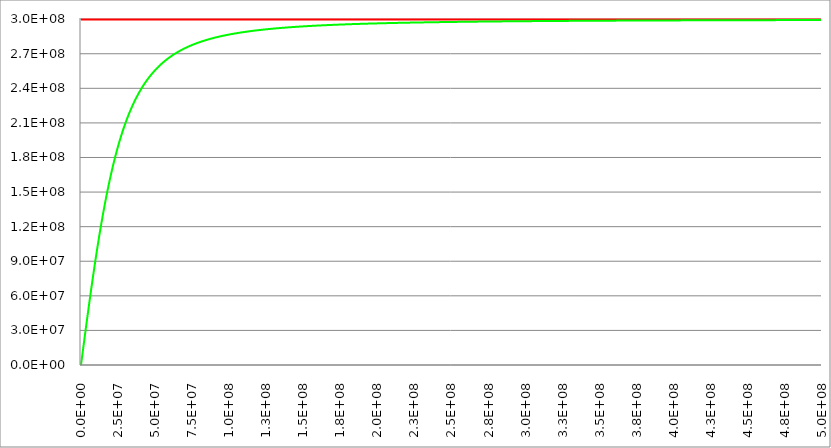
| Category | Series 1 | Series 0 | Series 2 |
|---|---|---|---|
| 0.0 | 299792458 | 0 |  |
| 250000.0 | 299792458 | 2449918.19 |  |
| 500000.0 | 299792458 | 4899345.62 |  |
| 750000.0 | 299792458 | 7347792.021 |  |
| 1000000.0 | 299792458 | 9794768.106 |  |
| 1250000.0 | 299792458 | 12239786.057 |  |
| 1500000.0 | 299792458 | 14682360.01 |  |
| 1750000.0 | 299792458 | 17122006.537 |  |
| 2000000.0 | 299792458 | 19558245.116 |  |
| 2250000.0 | 299792458 | 21990598.601 |  |
| 2500000.0 | 299792458 | 24418593.685 |  |
| 2750000.0 | 299792458 | 26841761.344 |  |
| 3000000.0 | 299792458 | 29259637.286 |  |
| 3250000.0 | 299792458 | 31671762.374 |  |
| 3500000.0 | 299792458 | 34077683.052 |  |
| 3750000.0 | 299792458 | 36476951.747 |  |
| 4000000.0 | 299792458 | 38869127.264 |  |
| 4250000.0 | 299792458 | 41253775.165 |  |
| 4500000.0 | 299792458 | 43630468.134 |  |
| 4750000.0 | 299792458 | 45998786.326 |  |
| 5000000.0 | 299792458 | 48358317.698 |  |
| 5250000.0 | 299792458 | 50708658.331 |  |
| 5500000.0 | 299792458 | 53049412.725 |  |
| 5750000.0 | 299792458 | 55380194.085 |  |
| 6000000.0 | 299792458 | 57700624.584 |  |
| 6250000.0 | 299792458 | 60010335.612 |  |
| 6500000.0 | 299792458 | 62308968.001 |  |
| 6750000.0 | 299792458 | 64596172.241 |  |
| 7000000.0 | 299792458 | 66871608.67 |  |
| 7250000.0 | 299792458 | 69134947.645 |  |
| 7500000.0 | 299792458 | 71385869.702 |  |
| 7750000.0 | 299792458 | 73624065.691 |  |
| 8000000.0 | 299792458 | 75849236.893 |  |
| 8250000.0 | 299792458 | 78061095.124 |  |
| 8500000.0 | 299792458 | 80259362.817 |  |
| 8750000.0 | 299792458 | 82443773.085 |  |
| 9000000.0 | 299792458 | 84614069.773 |  |
| 9250000.0 | 299792458 | 86770007.487 |  |
| 9500000.0 | 299792458 | 88911351.607 |  |
| 9750000.0 | 299792458 | 91037878.29 |  |
| 10000000.0 | 299792458 | 93149374.452 |  |
| 10250000.0 | 299792458 | 95245637.732 |  |
| 10500000.0 | 299792458 | 97326476.452 |  |
| 10750000.0 | 299792458 | 99391709.551 |  |
| 11000000.0 | 299792458 | 101441166.513 |  |
| 11250000.0 | 299792458 | 103474687.28 |  |
| 11500000.0 | 299792458 | 105492122.154 |  |
| 11750000.0 | 299792458 | 107493331.684 |  |
| 12000000.0 | 299792458 | 109478186.546 |  |
| 12250000.0 | 299792458 | 111446567.407 |  |
| 12500000.0 | 299792458 | 113398364.789 |  |
| 12750000.0 | 299792458 | 115333478.91 |  |
| 13000000.0 | 299792458 | 117251819.531 |  |
| 13250000.0 | 299792458 | 119153305.782 |  |
| 13500000.0 | 299792458 | 121037865.991 |  |
| 13750000.0 | 299792458 | 122905437.501 |  |
| 14000000.0 | 299792458 | 124755966.481 |  |
| 14250000.0 | 299792458 | 126589407.732 |  |
| 14500000.0 | 299792458 | 128405724.492 |  |
| 14750000.0 | 299792458 | 130204888.227 |  |
| 15000000.0 | 299792458 | 131986878.43 |  |
| 15250000.0 | 299792458 | 133751682.41 |  |
| 15500000.0 | 299792458 | 135499295.077 |  |
| 15750000.0 | 299792458 | 137229718.728 |  |
| 16000000.0 | 299792458 | 138942962.833 |  |
| 16250000.0 | 299792458 | 140639043.813 |  |
| 16500000.0 | 299792458 | 142317984.824 |  |
| 16750000.0 | 299792458 | 143979815.538 |  |
| 17000000.0 | 299792458 | 145624571.923 |  |
| 17250000.0 | 299792458 | 147252296.024 |  |
| 17500000.0 | 299792458 | 148863035.746 |  |
| 17750000.0 | 299792458 | 150456844.637 |  |
| 18000000.0 | 299792458 | 152033781.672 |  |
| 18250000.0 | 299792458 | 153593911.042 |  |
| 18500000.0 | 299792458 | 155137301.936 |  |
| 18750000.0 | 299792458 | 156664028.342 |  |
| 19000000.0 | 299792458 | 158174168.829 |  |
| 19250000.0 | 299792458 | 159667806.353 |  |
| 19500000.0 | 299792458 | 161145028.049 |  |
| 19750000.0 | 299792458 | 162605925.036 |  |
| 20000000.0 | 299792458 | 164050592.226 |  |
| 20250000.0 | 299792458 | 165479128.126 |  |
| 20500000.0 | 299792458 | 166891634.656 |  |
| 20750000.0 | 299792458 | 168288216.966 |  |
| 21000000.0 | 299792458 | 169668983.253 |  |
| 21250000.0 | 299792458 | 171034044.589 |  |
| 21500000.0 | 299792458 | 172383514.746 |  |
| 21750000.0 | 299792458 | 173717510.035 |  |
| 22000000.0 | 299792458 | 175036149.135 |  |
| 22250000.0 | 299792458 | 176339552.941 |  |
| 22500000.0 | 299792458 | 177627844.405 |  |
| 22750000.0 | 299792458 | 178901148.39 |  |
| 23000000.0 | 299792458 | 180159591.519 |  |
| 23250000.0 | 299792458 | 181403302.038 |  |
| 23500000.0 | 299792458 | 182632409.68 |  |
| 23750000.0 | 299792458 | 183847045.524 |  |
| 24000000.0 | 299792458 | 185047341.876 |  |
| 24250000.0 | 299792458 | 186233432.14 |  |
| 24500000.0 | 299792458 | 187405450.698 |  |
| 24750000.0 | 299792458 | 188563532.794 |  |
| 25000000.0 | 299792458 | 189707814.425 |  |
| 25250000.0 | 299792458 | 190838432.228 |  |
| 25500000.0 | 299792458 | 191955523.383 |  |
| 25750000.0 | 299792458 | 193059225.507 |  |
| 26000000.0 | 299792458 | 194149676.563 |  |
| 26250000.0 | 299792458 | 195227014.765 |  |
| 26500000.0 | 299792458 | 196291378.49 |  |
| 26750000.0 | 299792458 | 197342906.197 |  |
| 27000000.0 | 299792458 | 198381736.34 |  |
| 27250000.0 | 299792458 | 199408007.296 |  |
| 27500000.0 | 299792458 | 200421857.288 |  |
| 27750000.0 | 299792458 | 201423424.315 |  |
| 28000000.0 | 299792458 | 202412846.085 |  |
| 28250000.0 | 299792458 | 203390259.951 |  |
| 28500000.0 | 299792458 | 204355802.85 |  |
| 28750000.0 | 299792458 | 205309611.243 |  |
| 29000000.0 | 299792458 | 206251821.065 |  |
| 29250000.0 | 299792458 | 207182567.665 |  |
| 29500000.0 | 299792458 | 208101985.763 |  |
| 29750000.0 | 299792458 | 209010209.403 |  |
| 30000000.0 | 299792458 | 209907371.905 |  |
| 30250000.0 | 299792458 | 210793605.824 |  |
| 30500000.0 | 299792458 | 211669042.915 |  |
| 30750000.0 | 299792458 | 212533814.093 |  |
| 31000000.0 | 299792458 | 213388049.398 |  |
| 31250000.0 | 299792458 | 214231877.964 |  |
| 31500000.0 | 299792458 | 215065427.988 |  |
| 31750000.0 | 299792458 | 215888826.703 |  |
| 32000000.0 | 299792458 | 216702200.352 |  |
| 32250000.0 | 299792458 | 217505674.159 |  |
| 32500000.0 | 299792458 | 218299372.315 |  |
| 32750000.0 | 299792458 | 219083417.95 |  |
| 33000000.0 | 299792458 | 219857933.118 |  |
| 33250000.0 | 299792458 | 220623038.777 |  |
| 33500000.0 | 299792458 | 221378854.777 |  |
| 33750000.0 | 299792458 | 222125499.841 |  |
| 34000000.0 | 299792458 | 222863091.555 |  |
| 34250000.0 | 299792458 | 223591746.357 |  |
| 34500000.0 | 299792458 | 224311579.525 |  |
| 34750000.0 | 299792458 | 225022705.169 |  |
| 35000000.0 | 299792458 | 225725236.222 |  |
| 35250000.0 | 299792458 | 226419284.437 |  |
| 35500000.0 | 299792458 | 227104960.378 |  |
| 35750000.0 | 299792458 | 227782373.416 |  |
| 36000000.0 | 299792458 | 228451631.728 |  |
| 36250000.0 | 299792458 | 229112842.29 |  |
| 36500000.0 | 299792458 | 229766110.881 |  |
| 36750000.0 | 299792458 | 230411542.078 |  |
| 37000000.0 | 299792458 | 231049239.259 |  |
| 37250000.0 | 299792458 | 231679304.6 |  |
| 37500000.0 | 299792458 | 232301839.082 |  |
| 37750000.0 | 299792458 | 232916942.487 |  |
| 38000000.0 | 299792458 | 233524713.408 |  |
| 38250000.0 | 299792458 | 234125249.247 |  |
| 38500000.0 | 299792458 | 234718646.22 |  |
| 38750000.0 | 299792458 | 235304999.364 |  |
| 39000000.0 | 299792458 | 235884402.54 |  |
| 39250000.0 | 299792458 | 236456948.443 |  |
| 39500000.0 | 299792458 | 237022728.599 |  |
| 39750000.0 | 299792458 | 237581833.383 |  |
| 40000000.0 | 299792458 | 238134352.017 |  |
| 40250000.0 | 299792458 | 238680372.582 |  |
| 40500000.0 | 299792458 | 239219982.024 |  |
| 40750000.0 | 299792458 | 239753266.165 |  |
| 41000000.0 | 299792458 | 240280309.705 |  |
| 41250000.0 | 299792458 | 240801196.238 |  |
| 41500000.0 | 299792458 | 241316008.255 |  |
| 41750000.0 | 299792458 | 241824827.159 |  |
| 42000000.0 | 299792458 | 242327733.269 |  |
| 42250000.0 | 299792458 | 242824805.831 |  |
| 42500000.0 | 299792458 | 243316123.029 |  |
| 42750000.0 | 299792458 | 243801761.997 |  |
| 43000000.0 | 299792458 | 244281798.822 |  |
| 43250000.0 | 299792458 | 244756308.563 |  |
| 43500000.0 | 299792458 | 245225365.254 |  |
| 43750000.0 | 299792458 | 245689041.919 |  |
| 44000000.0 | 299792458 | 246147410.581 |  |
| 44250000.0 | 299792458 | 246600542.272 |  |
| 44500000.0 | 299792458 | 247048507.046 |  |
| 44750000.0 | 299792458 | 247491373.986 |  |
| 45000000.0 | 299792458 | 247929211.219 |  |
| 45250000.0 | 299792458 | 248362085.924 |  |
| 45500000.0 | 299792458 | 248790064.343 |  |
| 45750000.0 | 299792458 | 249213211.795 |  |
| 46000000.0 | 299792458 | 249631592.682 |  |
| 46250000.0 | 299792458 | 250045270.504 |  |
| 46500000.0 | 299792458 | 250454307.868 |  |
| 46750000.0 | 299792458 | 250858766.499 |  |
| 47000000.0 | 299792458 | 251258707.251 |  |
| 47250000.0 | 299792458 | 251654190.119 |  |
| 47500000.0 | 299792458 | 252045274.248 |  |
| 47750000.0 | 299792458 | 252432017.945 |  |
| 48000000.0 | 299792458 | 252814478.689 |  |
| 48250000.0 | 299792458 | 253192713.142 |  |
| 48500000.0 | 299792458 | 253566777.16 |  |
| 48750000.0 | 299792458 | 253936725.803 |  |
| 49000000.0 | 299792458 | 254302613.346 |  |
| 49250000.0 | 299792458 | 254664493.288 |  |
| 49500000.0 | 299792458 | 255022418.365 |  |
| 49750000.0 | 299792458 | 255376440.558 |  |
| 50000000.0 | 299792458 | 255726611.105 |  |
| 50250000.0 | 299792458 | 256072980.509 |  |
| 50500000.0 | 299792458 | 256415598.55 |  |
| 50750000.0 | 299792458 | 256754514.293 |  |
| 51000000.0 | 299792458 | 257089776.102 |  |
| 51250000.0 | 299792458 | 257421431.643 |  |
| 51500000.0 | 299792458 | 257749527.9 |  |
| 51750000.0 | 299792458 | 258074111.182 |  |
| 52000000.0 | 299792458 | 258395227.133 |  |
| 52250000.0 | 299792458 | 258712920.741 |  |
| 52500000.0 | 299792458 | 259027236.346 |  |
| 52750000.0 | 299792458 | 259338217.652 |  |
| 53000000.0 | 299792458 | 259645907.736 |  |
| 53250000.0 | 299792458 | 259950349.054 |  |
| 53500000.0 | 299792458 | 260251583.452 |  |
| 53750000.0 | 299792458 | 260549652.175 |  |
| 54000000.0 | 299792458 | 260844595.876 |  |
| 54250000.0 | 299792458 | 261136454.624 |  |
| 54500000.0 | 299792458 | 261425267.911 |  |
| 54750000.0 | 299792458 | 261711074.663 |  |
| 55000000.0 | 299792458 | 261993913.248 |  |
| 55250000.0 | 299792458 | 262273821.481 |  |
| 55500000.0 | 299792458 | 262550836.637 |  |
| 55750000.0 | 299792458 | 262824995.456 |  |
| 56000000.0 | 299792458 | 263096334.151 |  |
| 56250000.0 | 299792458 | 263364888.416 |  |
| 56500000.0 | 299792458 | 263630693.436 |  |
| 56750000.0 | 299792458 | 263893783.889 |  |
| 57000000.0 | 299792458 | 264154193.961 |  |
| 57250000.0 | 299792458 | 264411957.347 |  |
| 57500000.0 | 299792458 | 264667107.261 |  |
| 57750000.0 | 299792458 | 264919676.444 |  |
| 58000000.0 | 299792458 | 265169697.17 |  |
| 58250000.0 | 299792458 | 265417201.252 |  |
| 58500000.0 | 299792458 | 265662220.052 |  |
| 58750000.0 | 299792458 | 265904784.483 |  |
| 59000000.0 | 299792458 | 266144925.021 |  |
| 59250000.0 | 299792458 | 266382671.708 |  |
| 59500000.0 | 299792458 | 266618054.161 |  |
| 59750000.0 | 299792458 | 266851101.576 |  |
| 60000000.0 | 299792458 | 267081842.734 |  |
| 60250000.0 | 299792458 | 267310306.012 |  |
| 60500000.0 | 299792458 | 267536519.385 |  |
| 60750000.0 | 299792458 | 267760510.43 |  |
| 61000000.0 | 299792458 | 267982306.339 |  |
| 61250000.0 | 299792458 | 268201933.919 |  |
| 61500000.0 | 299792458 | 268419419.598 |  |
| 61750000.0 | 299792458 | 268634789.436 |  |
| 62000000.0 | 299792458 | 268848069.125 |  |
| 62250000.0 | 299792458 | 269059283.995 |  |
| 62500000.0 | 299792458 | 269268459.024 |  |
| 62750000.0 | 299792458 | 269475618.838 |  |
| 63000000.0 | 299792458 | 269680787.721 |  |
| 63250000.0 | 299792458 | 269883989.616 |  |
| 63500000.0 | 299792458 | 270085248.133 |  |
| 63750000.0 | 299792458 | 270284586.552 |  |
| 64000000.0 | 299792458 | 270482027.831 |  |
| 64250000.0 | 299792458 | 270677594.608 |  |
| 64500000.0 | 299792458 | 270871309.207 |  |
| 64750000.0 | 299792458 | 271063193.642 |  |
| 65000000.0 | 299792458 | 271253269.623 |  |
| 65250000.0 | 299792458 | 271441558.561 |  |
| 65500000.0 | 299792458 | 271628081.569 |  |
| 65750000.0 | 299792458 | 271812859.472 |  |
| 66000000.0 | 299792458 | 271995912.805 |  |
| 66250000.0 | 299792458 | 272177261.824 |  |
| 66500000.0 | 299792458 | 272356926.505 |  |
| 66750000.0 | 299792458 | 272534926.55 |  |
| 67000000.0 | 299792458 | 272711281.393 |  |
| 67250000.0 | 299792458 | 272886010.201 |  |
| 67500000.0 | 299792458 | 273059131.88 |  |
| 67750000.0 | 299792458 | 273230665.079 |  |
| 68000000.0 | 299792458 | 273400628.191 |  |
| 68250000.0 | 299792458 | 273569039.362 |  |
| 68500000.0 | 299792458 | 273735916.49 |  |
| 68750000.0 | 299792458 | 273901277.231 |  |
| 69000000.0 | 299792458 | 274065139.002 |  |
| 69250000.0 | 299792458 | 274227518.985 |  |
| 69500000.0 | 299792458 | 274388434.131 |  |
| 69750000.0 | 299792458 | 274547901.162 |  |
| 70000000.0 | 299792458 | 274705936.575 |  |
| 70250000.0 | 299792458 | 274862556.646 |  |
| 70500000.0 | 299792458 | 275017777.433 |  |
| 70750000.0 | 299792458 | 275171614.78 |  |
| 71000000.0 | 299792458 | 275324084.316 |  |
| 71250000.0 | 299792458 | 275475201.466 |  |
| 71500000.0 | 299792458 | 275624981.448 |  |
| 71750000.0 | 299792458 | 275773439.275 |  |
| 72000000.0 | 299792458 | 275920589.766 |  |
| 72250000.0 | 299792458 | 276066447.538 |  |
| 72500000.0 | 299792458 | 276211027.02 |  |
| 72750000.0 | 299792458 | 276354342.445 |  |
| 73000000.0 | 299792458 | 276496407.864 |  |
| 73250000.0 | 299792458 | 276637237.138 |  |
| 73500000.0 | 299792458 | 276776843.95 |  |
| 73750000.0 | 299792458 | 276915241.8 |  |
| 74000000.0 | 299792458 | 277052444.014 |  |
| 74250000.0 | 299792458 | 277188463.741 |  |
| 74500000.0 | 299792458 | 277323313.962 |  |
| 74750000.0 | 299792458 | 277457007.485 |  |
| 75000000.0 | 299792458 | 277589556.954 |  |
| 75250000.0 | 299792458 | 277720974.848 |  |
| 75500000.0 | 299792458 | 277851273.483 |  |
| 75750000.0 | 299792458 | 277980465.018 |  |
| 76000000.0 | 299792458 | 278108561.454 |  |
| 76250000.0 | 299792458 | 278235574.635 |  |
| 76500000.0 | 299792458 | 278361516.256 |  |
| 76750000.0 | 299792458 | 278486397.86 |  |
| 77000000.0 | 299792458 | 278610230.841 |  |
| 77250000.0 | 299792458 | 278733026.449 |  |
| 77500000.0 | 299792458 | 278854795.788 |  |
| 77750000.0 | 299792458 | 278975549.823 |  |
| 78000000.0 | 299792458 | 279095299.376 |  |
| 78250000.0 | 299792458 | 279214055.135 |  |
| 78500000.0 | 299792458 | 279331827.648 |  |
| 78750000.0 | 299792458 | 279448627.334 |  |
| 79000000.0 | 299792458 | 279564464.476 |  |
| 79250000.0 | 299792458 | 279679349.23 |  |
| 79500000.0 | 299792458 | 279793291.622 |  |
| 79750000.0 | 299792458 | 279906301.554 |  |
| 80000000.0 | 299792458 | 280018388.802 |  |
| 80250000.0 | 299792458 | 280129563.019 |  |
| 80500000.0 | 299792458 | 280239833.738 |  |
| 80750000.0 | 299792458 | 280349210.374 |  |
| 81000000.0 | 299792458 | 280457702.221 |  |
| 81250000.0 | 299792458 | 280565318.462 |  |
| 81500000.0 | 299792458 | 280672068.163 |  |
| 81750000.0 | 299792458 | 280777960.276 |  |
| 82000000.0 | 299792458 | 280883003.647 |  |
| 82250000.0 | 299792458 | 280987207.008 |  |
| 82500000.0 | 299792458 | 281090578.985 |  |
| 82750000.0 | 299792458 | 281193128.099 |  |
| 83000000.0 | 299792458 | 281294862.763 |  |
| 83250000.0 | 299792458 | 281395791.291 |  |
| 83500000.0 | 299792458 | 281495921.891 |  |
| 83750000.0 | 299792458 | 281595262.673 |  |
| 84000000.0 | 299792458 | 281693821.649 |  |
| 84250000.0 | 299792458 | 281791606.73 |  |
| 84500000.0 | 299792458 | 281888625.733 |  |
| 84750000.0 | 299792458 | 281984886.38 |  |
| 85000000.0 | 299792458 | 282080396.3 |  |
| 85250000.0 | 299792458 | 282175163.027 |  |
| 85500000.0 | 299792458 | 282269194.008 |  |
| 85750000.0 | 299792458 | 282362496.596 |  |
| 86000000.0 | 299792458 | 282455078.06 |  |
| 86250000.0 | 299792458 | 282546945.578 |  |
| 86500000.0 | 299792458 | 282638106.243 |  |
| 86750000.0 | 299792458 | 282728567.065 |  |
| 87000000.0 | 299792458 | 282818334.967 |  |
| 87250000.0 | 299792458 | 282907416.792 |  |
| 87500000.0 | 299792458 | 282995819.302 |  |
| 87750000.0 | 299792458 | 283083549.175 |  |
| 88000000.0 | 299792458 | 283170613.015 |  |
| 88250000.0 | 299792458 | 283257017.343 |  |
| 88500000.0 | 299792458 | 283342768.606 |  |
| 88750000.0 | 299792458 | 283427873.174 |  |
| 89000000.0 | 299792458 | 283512337.343 |  |
| 89250000.0 | 299792458 | 283596167.332 |  |
| 89500000.0 | 299792458 | 283679369.291 |  |
| 89750000.0 | 299792458 | 283761949.296 |  |
| 90000000.0 | 299792458 | 283843913.352 |  |
| 90250000.0 | 299792458 | 283925267.394 |  |
| 90500000.0 | 299792458 | 284006017.288 |  |
| 90750000.0 | 299792458 | 284086168.832 |  |
| 91000000.0 | 299792458 | 284165727.757 |  |
| 91250000.0 | 299792458 | 284244699.727 |  |
| 91500000.0 | 299792458 | 284323090.342 |  |
| 91750000.0 | 299792458 | 284400905.134 |  |
| 92000000.0 | 299792458 | 284478149.576 |  |
| 92250000.0 | 299792458 | 284554829.074 |  |
| 92500000.0 | 299792458 | 284630948.974 |  |
| 92750000.0 | 299792458 | 284706514.561 |  |
| 93000000.0 | 299792458 | 284781531.059 |  |
| 93250000.0 | 299792458 | 284856003.632 |  |
| 93500000.0 | 299792458 | 284929937.385 |  |
| 93750000.0 | 299792458 | 285003337.367 |  |
| 94000000.0 | 299792458 | 285076208.567 |  |
| 94250000.0 | 299792458 | 285148555.92 |  |
| 94500000.0 | 299792458 | 285220384.303 |  |
| 94750000.0 | 299792458 | 285291698.539 |  |
| 95000000.0 | 299792458 | 285362503.397 |  |
| 95250000.0 | 299792458 | 285432803.592 |  |
| 95500000.0 | 299792458 | 285502603.786 |  |
| 95750000.0 | 299792458 | 285571908.588 |  |
| 96000000.0 | 299792458 | 285640722.558 |  |
| 96250000.0 | 299792458 | 285709050.202 |  |
| 96500000.0 | 299792458 | 285776895.977 |  |
| 96750000.0 | 299792458 | 285844264.292 |  |
| 97000000.0 | 299792458 | 285911159.504 |  |
| 97250000.0 | 299792458 | 285977585.925 |  |
| 97500000.0 | 299792458 | 286043547.817 |  |
| 97750000.0 | 299792458 | 286109049.395 |  |
| 98000000.0 | 299792458 | 286174094.828 |  |
| 98250000.0 | 299792458 | 286238688.241 |  |
| 98500000.0 | 299792458 | 286302833.711 |  |
| 98750000.0 | 299792458 | 286366535.271 |  |
| 99000000.0 | 299792458 | 286429796.911 |  |
| 99250000.0 | 299792458 | 286492622.575 |  |
| 99500000.0 | 299792458 | 286555016.168 |  |
| 99750000.0 | 299792458 | 286616981.548 |  |
| 100000000.0 | 299792458 | 286678522.534 |  |
| 100250000.0 | 299792458 | 286739642.903 |  |
| 100500000.0 | 299792458 | 286800346.391 |  |
| 100750000.0 | 299792458 | 286860636.693 |  |
| 101000000.0 | 299792458 | 286920517.465 |  |
| 101250000.0 | 299792458 | 286979992.323 |  |
| 101500000.0 | 299792458 | 287039064.845 |  |
| 101750000.0 | 299792458 | 287097738.57 |  |
| 102000000.0 | 299792458 | 287156016.999 |  |
| 102250000.0 | 299792458 | 287213903.596 |  |
| 102500000.0 | 299792458 | 287271401.788 |  |
| 102750000.0 | 299792458 | 287328514.964 |  |
| 103000000.0 | 299792458 | 287385246.48 |  |
| 103250000.0 | 299792458 | 287441599.654 |  |
| 103500000.0 | 299792458 | 287497577.77 |  |
| 103750000.0 | 299792458 | 287553184.076 |  |
| 104000000.0 | 299792458 | 287608421.787 |  |
| 104250000.0 | 299792458 | 287663294.083 |  |
| 104500000.0 | 299792458 | 287717804.112 |  |
| 104750000.0 | 299792458 | 287771954.988 |  |
| 105000000.0 | 299792458 | 287825749.793 |  |
| 105250000.0 | 299792458 | 287879191.576 |  |
| 105500000.0 | 299792458 | 287932283.354 |  |
| 105750000.0 | 299792458 | 287985028.113 |  |
| 106000000.0 | 299792458 | 288037428.808 |  |
| 106250000.0 | 299792458 | 288089488.364 |  |
| 106500000.0 | 299792458 | 288141209.674 |  |
| 106750000.0 | 299792458 | 288192595.602 |  |
| 107000000.0 | 299792458 | 288243648.983 |  |
| 107250000.0 | 299792458 | 288294372.622 |  |
| 107500000.0 | 299792458 | 288344769.295 |  |
| 107750000.0 | 299792458 | 288394841.75 |  |
| 108000000.0 | 299792458 | 288444592.706 |  |
| 108250000.0 | 299792458 | 288494024.855 |  |
| 108500000.0 | 299792458 | 288543140.861 |  |
| 108750000.0 | 299792458 | 288591943.362 |  |
| 109000000.0 | 299792458 | 288640434.966 |  |
| 109250000.0 | 299792458 | 288688618.259 |  |
| 109500000.0 | 299792458 | 288736495.797 |  |
| 109750000.0 | 299792458 | 288784070.111 |  |
| 110000000.0 | 299792458 | 288831343.708 |  |
| 110250000.0 | 299792458 | 288878319.067 |  |
| 110500000.0 | 299792458 | 288924998.646 |  |
| 110750000.0 | 299792458 | 288971384.873 |  |
| 111000000.0 | 299792458 | 289017480.156 |  |
| 111250000.0 | 299792458 | 289063286.877 |  |
| 111500000.0 | 299792458 | 289108807.394 |  |
| 111750000.0 | 299792458 | 289154044.042 |  |
| 112000000.0 | 299792458 | 289198999.133 |  |
| 112250000.0 | 299792458 | 289243674.955 |  |
| 112500000.0 | 299792458 | 289288073.774 |  |
| 112750000.0 | 299792458 | 289332197.833 |  |
| 113000000.0 | 299792458 | 289376049.353 |  |
| 113250000.0 | 299792458 | 289419630.534 |  |
| 113500000.0 | 299792458 | 289462943.552 |  |
| 113750000.0 | 299792458 | 289505990.565 |  |
| 114000000.0 | 299792458 | 289548773.705 |  |
| 114250000.0 | 299792458 | 289591295.087 |  |
| 114500000.0 | 299792458 | 289633556.805 |  |
| 114750000.0 | 299792458 | 289675560.93 |  |
| 115000000.0 | 299792458 | 289717309.515 |  |
| 115250000.0 | 299792458 | 289758804.593 |  |
| 115500000.0 | 299792458 | 289800048.174 |  |
| 115750000.0 | 299792458 | 289841042.254 |  |
| 116000000.0 | 299792458 | 289881788.804 |  |
| 116250000.0 | 299792458 | 289922289.78 |  |
| 116500000.0 | 299792458 | 289962547.118 |  |
| 116750000.0 | 299792458 | 290002562.733 |  |
| 117000000.0 | 299792458 | 290042338.524 |  |
| 117250000.0 | 299792458 | 290081876.372 |  |
| 117500000.0 | 299792458 | 290121178.138 |  |
| 117750000.0 | 299792458 | 290160245.667 |  |
| 118000000.0 | 299792458 | 290199080.785 |  |
| 118250000.0 | 299792458 | 290237685.301 |  |
| 118500000.0 | 299792458 | 290276061.008 |  |
| 118750000.0 | 299792458 | 290314209.679 |  |
| 119000000.0 | 299792458 | 290352133.073 |  |
| 119250000.0 | 299792458 | 290389832.931 |  |
| 119500000.0 | 299792458 | 290427310.977 |  |
| 119750000.0 | 299792458 | 290464568.921 |  |
| 120000000.0 | 299792458 | 290501608.454 |  |
| 120250000.0 | 299792458 | 290538431.252 |  |
| 120500000.0 | 299792458 | 290575038.976 |  |
| 120750000.0 | 299792458 | 290611433.271 |  |
| 121000000.0 | 299792458 | 290647615.767 |  |
| 121250000.0 | 299792458 | 290683588.076 |  |
| 121500000.0 | 299792458 | 290719351.8 |  |
| 121750000.0 | 299792458 | 290754908.522 |  |
| 122000000.0 | 299792458 | 290790259.81 |  |
| 122250000.0 | 299792458 | 290825407.221 |  |
| 122500000.0 | 299792458 | 290860352.294 |  |
| 122750000.0 | 299792458 | 290895096.556 |  |
| 123000000.0 | 299792458 | 290929641.518 |  |
| 123250000.0 | 299792458 | 290963988.679 |  |
| 123500000.0 | 299792458 | 290998139.522 |  |
| 123750000.0 | 299792458 | 291032095.518 |  |
| 124000000.0 | 299792458 | 291065858.125 |  |
| 124250000.0 | 299792458 | 291099428.785 |  |
| 124500000.0 | 299792458 | 291132808.929 |  |
| 124750000.0 | 299792458 | 291165999.975 |  |
| 125000000.0 | 299792458 | 291199003.326 |  |
| 125250000.0 | 299792458 | 291231820.374 |  |
| 125500000.0 | 299792458 | 291264452.498 |  |
| 125750000.0 | 299792458 | 291296901.065 |  |
| 126000000.0 | 299792458 | 291329167.427 |  |
| 126250000.0 | 299792458 | 291361252.928 |  |
| 126500000.0 | 299792458 | 291393158.896 |  |
| 126750000.0 | 299792458 | 291424886.648 |  |
| 127000000.0 | 299792458 | 291456437.491 |  |
| 127250000.0 | 299792458 | 291487812.718 |  |
| 127500000.0 | 299792458 | 291519013.612 |  |
| 127750000.0 | 299792458 | 291550041.443 |  |
| 128000000.0 | 299792458 | 291580897.47 |  |
| 128250000.0 | 299792458 | 291611582.942 |  |
| 128500000.0 | 299792458 | 291642099.095 |  |
| 128750000.0 | 299792458 | 291672447.156 |  |
| 129000000.0 | 299792458 | 291702628.339 |  |
| 129250000.0 | 299792458 | 291732643.849 |  |
| 129500000.0 | 299792458 | 291762494.879 |  |
| 129750000.0 | 299792458 | 291792182.611 |  |
| 130000000.0 | 299792458 | 291821708.219 |  |
| 130250000.0 | 299792458 | 291851072.865 |  |
| 130500000.0 | 299792458 | 291880277.7 |  |
| 130750000.0 | 299792458 | 291909323.866 |  |
| 131000000.0 | 299792458 | 291938212.495 |  |
| 131250000.0 | 299792458 | 291966944.709 |  |
| 131500000.0 | 299792458 | 291995521.619 |  |
| 131750000.0 | 299792458 | 292023944.328 |  |
| 132000000.0 | 299792458 | 292052213.928 |  |
| 132250000.0 | 299792458 | 292080331.503 |  |
| 132500000.0 | 299792458 | 292108298.126 |  |
| 132750000.0 | 299792458 | 292136114.861 |  |
| 133000000.0 | 299792458 | 292163782.763 |  |
| 133250000.0 | 299792458 | 292191302.879 |  |
| 133500000.0 | 299792458 | 292218676.245 |  |
| 133750000.0 | 299792458 | 292245903.889 |  |
| 134000000.0 | 299792458 | 292272986.83 |  |
| 134250000.0 | 299792458 | 292299926.079 |  |
| 134500000.0 | 299792458 | 292326722.637 |  |
| 134750000.0 | 299792458 | 292353377.497 |  |
| 135000000.0 | 299792458 | 292379891.644 |  |
| 135250000.0 | 299792458 | 292406266.053 |  |
| 135500000.0 | 299792458 | 292432501.693 |  |
| 135750000.0 | 299792458 | 292458599.523 |  |
| 136000000.0 | 299792458 | 292484560.494 |  |
| 136250000.0 | 299792458 | 292510385.549 |  |
| 136500000.0 | 299792458 | 292536075.625 |  |
| 136750000.0 | 299792458 | 292561631.647 |  |
| 137000000.0 | 299792458 | 292587054.536 |  |
| 137250000.0 | 299792458 | 292612345.203 |  |
| 137500000.0 | 299792458 | 292637504.552 |  |
| 137750000.0 | 299792458 | 292662533.48 |  |
| 138000000.0 | 299792458 | 292687432.875 |  |
| 138250000.0 | 299792458 | 292712203.62 |  |
| 138500000.0 | 299792458 | 292736846.586 |  |
| 138750000.0 | 299792458 | 292761362.643 |  |
| 139000000.0 | 299792458 | 292785752.648 |  |
| 139250000.0 | 299792458 | 292810017.454 |  |
| 139500000.0 | 299792458 | 292834157.907 |  |
| 139750000.0 | 299792458 | 292858174.844 |  |
| 140000000.0 | 299792458 | 292882069.097 |  |
| 140250000.0 | 299792458 | 292905841.49 |  |
| 140500000.0 | 299792458 | 292929492.84 |  |
| 140750000.0 | 299792458 | 292953023.958 |  |
| 141000000.0 | 299792458 | 292976435.648 |  |
| 141250000.0 | 299792458 | 292999728.708 |  |
| 141500000.0 | 299792458 | 293022903.928 |  |
| 141750000.0 | 299792458 | 293045962.092 |  |
| 142000000.0 | 299792458 | 293068903.979 |  |
| 142250000.0 | 299792458 | 293091730.359 |  |
| 142500000.0 | 299792458 | 293114441.999 |  |
| 142750000.0 | 299792458 | 293137039.657 |  |
| 143000000.0 | 299792458 | 293159524.085 |  |
| 143250000.0 | 299792458 | 293181896.031 |  |
| 143500000.0 | 299792458 | 293204156.234 |  |
| 143750000.0 | 299792458 | 293226305.43 |  |
| 144000000.0 | 299792458 | 293248344.347 |  |
| 144250000.0 | 299792458 | 293270273.708 |  |
| 144500000.0 | 299792458 | 293292094.229 |  |
| 144750000.0 | 299792458 | 293313806.621 |  |
| 145000000.0 | 299792458 | 293335411.591 |  |
| 145250000.0 | 299792458 | 293356909.837 |  |
| 145500000.0 | 299792458 | 293378302.053 |  |
| 145750000.0 | 299792458 | 293399588.929 |  |
| 146000000.0 | 299792458 | 293420771.146 |  |
| 146250000.0 | 299792458 | 293441849.383 |  |
| 146500000.0 | 299792458 | 293462824.311 |  |
| 146750000.0 | 299792458 | 293483696.597 |  |
| 147000000.0 | 299792458 | 293504466.903 |  |
| 147250000.0 | 299792458 | 293525135.885 |  |
| 147500000.0 | 299792458 | 293545704.193 |  |
| 147750000.0 | 299792458 | 293566172.473 |  |
| 148000000.0 | 299792458 | 293586541.367 |  |
| 148250000.0 | 299792458 | 293606811.509 |  |
| 148500000.0 | 299792458 | 293626983.53 |  |
| 148750000.0 | 299792458 | 293647058.055 |  |
| 149000000.0 | 299792458 | 293667035.707 |  |
| 149250000.0 | 299792458 | 293686917.099 |  |
| 149500000.0 | 299792458 | 293706702.844 |  |
| 149750000.0 | 299792458 | 293726393.546 |  |
| 150000000.0 | 299792458 | 293745989.809 |  |
| 150250000.0 | 299792458 | 293765492.228 |  |
| 150500000.0 | 299792458 | 293784901.396 |  |
| 150750000.0 | 299792458 | 293804217.9 |  |
| 151000000.0 | 299792458 | 293823442.322 |  |
| 151250000.0 | 299792458 | 293842575.242 |  |
| 151500000.0 | 299792458 | 293861617.234 |  |
| 151750000.0 | 299792458 | 293880568.865 |  |
| 152000000.0 | 299792458 | 293899430.703 |  |
| 152250000.0 | 299792458 | 293918203.307 |  |
| 152500000.0 | 299792458 | 293936887.233 |  |
| 152750000.0 | 299792458 | 293955483.034 |  |
| 153000000.0 | 299792458 | 293973991.258 |  |
| 153250000.0 | 299792458 | 293992412.448 |  |
| 153500000.0 | 299792458 | 294010747.143 |  |
| 153750000.0 | 299792458 | 294028995.879 |  |
| 154000000.0 | 299792458 | 294047159.188 |  |
| 154250000.0 | 299792458 | 294065237.595 |  |
| 154500000.0 | 299792458 | 294083231.625 |  |
| 154750000.0 | 299792458 | 294101141.797 |  |
| 155000000.0 | 299792458 | 294118968.625 |  |
| 155250000.0 | 299792458 | 294136712.621 |  |
| 155500000.0 | 299792458 | 294154374.293 |  |
| 155750000.0 | 299792458 | 294171954.144 |  |
| 156000000.0 | 299792458 | 294189452.674 |  |
| 156250000.0 | 299792458 | 294206870.379 |  |
| 156500000.0 | 299792458 | 294224207.751 |  |
| 156750000.0 | 299792458 | 294241465.278 |  |
| 157000000.0 | 299792458 | 294258643.446 |  |
| 157250000.0 | 299792458 | 294275742.736 |  |
| 157500000.0 | 299792458 | 294292763.625 |  |
| 157750000.0 | 299792458 | 294309706.588 |  |
| 158000000.0 | 299792458 | 294326572.095 |  |
| 158250000.0 | 299792458 | 294343360.613 |  |
| 158500000.0 | 299792458 | 294360072.605 |  |
| 158750000.0 | 299792458 | 294376708.533 |  |
| 159000000.0 | 299792458 | 294393268.851 |  |
| 159250000.0 | 299792458 | 294409754.014 |  |
| 159500000.0 | 299792458 | 294426164.472 |  |
| 159750000.0 | 299792458 | 294442500.671 |  |
| 160000000.0 | 299792458 | 294458763.054 |  |
| 160250000.0 | 299792458 | 294474952.061 |  |
| 160500000.0 | 299792458 | 294491068.13 |  |
| 160750000.0 | 299792458 | 294507111.693 |  |
| 161000000.0 | 299792458 | 294523083.181 |  |
| 161250000.0 | 299792458 | 294538983.022 |  |
| 161500000.0 | 299792458 | 294554811.639 |  |
| 161750000.0 | 299792458 | 294570569.453 |  |
| 162000000.0 | 299792458 | 294586256.883 |  |
| 162250000.0 | 299792458 | 294601874.342 |  |
| 162500000.0 | 299792458 | 294617422.243 |  |
| 162750000.0 | 299792458 | 294632900.995 |  |
| 163000000.0 | 299792458 | 294648311.004 |  |
| 163250000.0 | 299792458 | 294663652.672 |  |
| 163500000.0 | 299792458 | 294678926.399 |  |
| 163750000.0 | 299792458 | 294694132.583 |  |
| 164000000.0 | 299792458 | 294709271.618 |  |
| 164250000.0 | 299792458 | 294724343.894 |  |
| 164500000.0 | 299792458 | 294739349.802 |  |
| 164750000.0 | 299792458 | 294754289.725 |  |
| 165000000.0 | 299792458 | 294769164.048 |  |
| 165250000.0 | 299792458 | 294783973.151 |  |
| 165500000.0 | 299792458 | 294798717.41 |  |
| 165750000.0 | 299792458 | 294813397.202 |  |
| 166000000.0 | 299792458 | 294828012.897 |  |
| 166250000.0 | 299792458 | 294842564.866 |  |
| 166500000.0 | 299792458 | 294857053.475 |  |
| 166750000.0 | 299792458 | 294871479.089 |  |
| 167000000.0 | 299792458 | 294885842.068 |  |
| 167250000.0 | 299792458 | 294900142.773 |  |
| 167500000.0 | 299792458 | 294914381.559 |  |
| 167750000.0 | 299792458 | 294928558.781 |  |
| 168000000.0 | 299792458 | 294942674.79 |  |
| 168250000.0 | 299792458 | 294956729.935 |  |
| 168500000.0 | 299792458 | 294970724.563 |  |
| 168750000.0 | 299792458 | 294984659.017 |  |
| 169000000.0 | 299792458 | 294998533.64 |  |
| 169250000.0 | 299792458 | 295012348.77 |  |
| 169500000.0 | 299792458 | 295026104.744 |  |
| 169750000.0 | 299792458 | 295039801.898 |  |
| 170000000.0 | 299792458 | 295053440.563 |  |
| 170250000.0 | 299792458 | 295067021.069 |  |
| 170500000.0 | 299792458 | 295080543.743 |  |
| 170750000.0 | 299792458 | 295094008.911 |  |
| 171000000.0 | 299792458 | 295107416.896 |  |
| 171250000.0 | 299792458 | 295120768.019 |  |
| 171500000.0 | 299792458 | 295134062.597 |  |
| 171750000.0 | 299792458 | 295147300.948 |  |
| 172000000.0 | 299792458 | 295160483.386 |  |
| 172250000.0 | 299792458 | 295173610.222 |  |
| 172500000.0 | 299792458 | 295186681.767 |  |
| 172750000.0 | 299792458 | 295199698.327 |  |
| 173000000.0 | 299792458 | 295212660.209 |  |
| 173250000.0 | 299792458 | 295225567.716 |  |
| 173500000.0 | 299792458 | 295238421.149 |  |
| 173750000.0 | 299792458 | 295251220.808 |  |
| 174000000.0 | 299792458 | 295263966.99 |  |
| 174250000.0 | 299792458 | 295276659.99 |  |
| 174500000.0 | 299792458 | 295289300.101 |  |
| 174750000.0 | 299792458 | 295301887.614 |  |
| 175000000.0 | 299792458 | 295314422.819 |  |
| 175250000.0 | 299792458 | 295326906.003 |  |
| 175500000.0 | 299792458 | 295339337.451 |  |
| 175750000.0 | 299792458 | 295351717.446 |  |
| 176000000.0 | 299792458 | 295364046.27 |  |
| 176250000.0 | 299792458 | 295376324.203 |  |
| 176500000.0 | 299792458 | 295388551.521 |  |
| 176750000.0 | 299792458 | 295400728.502 |  |
| 177000000.0 | 299792458 | 295412855.417 |  |
| 177250000.0 | 299792458 | 295424932.541 |  |
| 177500000.0 | 299792458 | 295436960.142 |  |
| 177750000.0 | 299792458 | 295448938.489 |  |
| 178000000.0 | 299792458 | 295460867.849 |  |
| 178250000.0 | 299792458 | 295472748.487 |  |
| 178500000.0 | 299792458 | 295484580.666 |  |
| 178750000.0 | 299792458 | 295496364.646 |  |
| 179000000.0 | 299792458 | 295508100.687 |  |
| 179250000.0 | 299792458 | 295519789.048 |  |
| 179500000.0 | 299792458 | 295531429.984 |  |
| 179750000.0 | 299792458 | 295543023.75 |  |
| 180000000.0 | 299792458 | 295554570.598 |  |
| 180250000.0 | 299792458 | 295566070.779 |  |
| 180500000.0 | 299792458 | 295577524.543 |  |
| 180750000.0 | 299792458 | 295588932.137 |  |
| 181000000.0 | 299792458 | 295600293.807 |  |
| 181250000.0 | 299792458 | 295611609.798 |  |
| 181500000.0 | 299792458 | 295622880.353 |  |
| 181750000.0 | 299792458 | 295634105.712 |  |
| 182000000.0 | 299792458 | 295645286.116 |  |
| 182250000.0 | 299792458 | 295656421.802 |  |
| 182500000.0 | 299792458 | 295667513.007 |  |
| 182750000.0 | 299792458 | 295678559.966 |  |
| 183000000.0 | 299792458 | 295689562.912 |  |
| 183250000.0 | 299792458 | 295700522.078 |  |
| 183500000.0 | 299792458 | 295711437.693 |  |
| 183750000.0 | 299792458 | 295722309.986 |  |
| 184000000.0 | 299792458 | 295733139.185 |  |
| 184250000.0 | 299792458 | 295743925.515 |  |
| 184500000.0 | 299792458 | 295754669.201 |  |
| 184750000.0 | 299792458 | 295765370.467 |  |
| 185000000.0 | 299792458 | 295776029.532 |  |
| 185250000.0 | 299792458 | 295786646.619 |  |
| 185500000.0 | 299792458 | 295797221.944 |  |
| 185750000.0 | 299792458 | 295807755.726 |  |
| 186000000.0 | 299792458 | 295818248.18 |  |
| 186250000.0 | 299792458 | 295828699.521 |  |
| 186500000.0 | 299792458 | 295839109.962 |  |
| 186750000.0 | 299792458 | 295849479.714 |  |
| 187000000.0 | 299792458 | 295859808.988 |  |
| 187250000.0 | 299792458 | 295870097.993 |  |
| 187500000.0 | 299792458 | 295880346.937 |  |
| 187750000.0 | 299792458 | 295890556.025 |  |
| 188000000.0 | 299792458 | 295900725.463 |  |
| 188250000.0 | 299792458 | 295910855.455 |  |
| 188500000.0 | 299792458 | 295920946.203 |  |
| 188750000.0 | 299792458 | 295930997.907 |  |
| 189000000.0 | 299792458 | 295941010.769 |  |
| 189250000.0 | 299792458 | 295950984.987 |  |
| 189500000.0 | 299792458 | 295960920.757 |  |
| 189750000.0 | 299792458 | 295970818.276 |  |
| 190000000.0 | 299792458 | 295980677.739 |  |
| 190250000.0 | 299792458 | 295990499.339 |  |
| 190500000.0 | 299792458 | 296000283.269 |  |
| 190750000.0 | 299792458 | 296010029.719 |  |
| 191000000.0 | 299792458 | 296019738.881 |  |
| 191250000.0 | 299792458 | 296029410.942 |  |
| 191500000.0 | 299792458 | 296039046.09 |  |
| 191750000.0 | 299792458 | 296048644.512 |  |
| 192000000.0 | 299792458 | 296058206.393 |  |
| 192250000.0 | 299792458 | 296067731.916 |  |
| 192500000.0 | 299792458 | 296077221.266 |  |
| 192750000.0 | 299792458 | 296086674.623 |  |
| 193000000.0 | 299792458 | 296096092.168 |  |
| 193250000.0 | 299792458 | 296105474.081 |  |
| 193500000.0 | 299792458 | 296114820.54 |  |
| 193750000.0 | 299792458 | 296124131.722 |  |
| 194000000.0 | 299792458 | 296133407.805 |  |
| 194250000.0 | 299792458 | 296142648.962 |  |
| 194500000.0 | 299792458 | 296151855.368 |  |
| 194750000.0 | 299792458 | 296161027.195 |  |
| 195000000.0 | 299792458 | 296170164.617 |  |
| 195250000.0 | 299792458 | 296179267.803 |  |
| 195500000.0 | 299792458 | 296188336.923 |  |
| 195750000.0 | 299792458 | 296197372.146 |  |
| 196000000.0 | 299792458 | 296206373.639 |  |
| 196250000.0 | 299792458 | 296215341.571 |  |
| 196500000.0 | 299792458 | 296224276.105 |  |
| 196750000.0 | 299792458 | 296233177.406 |  |
| 197000000.0 | 299792458 | 296242045.639 |  |
| 197250000.0 | 299792458 | 296250880.966 |  |
| 197500000.0 | 299792458 | 296259683.548 |  |
| 197750000.0 | 299792458 | 296268453.546 |  |
| 198000000.0 | 299792458 | 296277191.12 |  |
| 198250000.0 | 299792458 | 296285896.428 |  |
| 198500000.0 | 299792458 | 296294569.629 |  |
| 198750000.0 | 299792458 | 296303210.878 |  |
| 199000000.0 | 299792458 | 296311820.333 |  |
| 199250000.0 | 299792458 | 296320398.146 |  |
| 199500000.0 | 299792458 | 296328944.474 |  |
| 199750000.0 | 299792458 | 296337459.468 |  |
| 200000000.0 | 299792458 | 296345943.281 |  |
| 200250000.0 | 299792458 | 296354396.064 |  |
| 200500000.0 | 299792458 | 296362817.966 |  |
| 200750000.0 | 299792458 | 296371209.139 |  |
| 201000000.0 | 299792458 | 296379569.729 |  |
| 201250000.0 | 299792458 | 296387899.884 |  |
| 201500000.0 | 299792458 | 296396199.752 |  |
| 201750000.0 | 299792458 | 296404469.478 |  |
| 202000000.0 | 299792458 | 296412709.207 |  |
| 202250000.0 | 299792458 | 296420919.083 |  |
| 202500000.0 | 299792458 | 296429099.25 |  |
| 202750000.0 | 299792458 | 296437249.848 |  |
| 203000000.0 | 299792458 | 296445371.021 |  |
| 203250000.0 | 299792458 | 296453462.909 |  |
| 203500000.0 | 299792458 | 296461525.652 |  |
| 203750000.0 | 299792458 | 296469559.388 |  |
| 204000000.0 | 299792458 | 296477564.256 |  |
| 204250000.0 | 299792458 | 296485540.393 |  |
| 204500000.0 | 299792458 | 296493487.936 |  |
| 204750000.0 | 299792458 | 296501407.021 |  |
| 205000000.0 | 299792458 | 296509297.782 |  |
| 205250000.0 | 299792458 | 296517160.353 |  |
| 205500000.0 | 299792458 | 296524994.869 |  |
| 205750000.0 | 299792458 | 296532801.462 |  |
| 206000000.0 | 299792458 | 296540580.262 |  |
| 206250000.0 | 299792458 | 296548331.403 |  |
| 206500000.0 | 299792458 | 296556055.013 |  |
| 206750000.0 | 299792458 | 296563751.222 |  |
| 207000000.0 | 299792458 | 296571420.159 |  |
| 207250000.0 | 299792458 | 296579061.953 |  |
| 207500000.0 | 299792458 | 296586676.729 |  |
| 207750000.0 | 299792458 | 296594264.615 |  |
| 208000000.0 | 299792458 | 296601825.737 |  |
| 208250000.0 | 299792458 | 296609360.22 |  |
| 208500000.0 | 299792458 | 296616868.187 |  |
| 208750000.0 | 299792458 | 296624349.763 |  |
| 209000000.0 | 299792458 | 296631805.07 |  |
| 209250000.0 | 299792458 | 296639234.231 |  |
| 209500000.0 | 299792458 | 296646637.367 |  |
| 209750000.0 | 299792458 | 296654014.599 |  |
| 210000000.0 | 299792458 | 296661366.047 |  |
| 210250000.0 | 299792458 | 296668691.83 |  |
| 210500000.0 | 299792458 | 296675992.067 |  |
| 210750000.0 | 299792458 | 296683266.876 |  |
| 211000000.0 | 299792458 | 296690516.374 |  |
| 211250000.0 | 299792458 | 296697740.678 |  |
| 211500000.0 | 299792458 | 296704939.904 |  |
| 211750000.0 | 299792458 | 296712114.168 |  |
| 212000000.0 | 299792458 | 296719263.584 |  |
| 212250000.0 | 299792458 | 296726388.265 |  |
| 212500000.0 | 299792458 | 296733488.326 |  |
| 212750000.0 | 299792458 | 296740563.879 |  |
| 213000000.0 | 299792458 | 296747615.037 |  |
| 213250000.0 | 299792458 | 296754641.91 |  |
| 213500000.0 | 299792458 | 296761644.609 |  |
| 213750000.0 | 299792458 | 296768623.245 |  |
| 214000000.0 | 299792458 | 296775577.928 |  |
| 214250000.0 | 299792458 | 296782508.765 |  |
| 214500000.0 | 299792458 | 296789415.866 |  |
| 214750000.0 | 299792458 | 296796299.338 |  |
| 215000000.0 | 299792458 | 296803159.289 |  |
| 215250000.0 | 299792458 | 296809995.824 |  |
| 215500000.0 | 299792458 | 296816809.05 |  |
| 215750000.0 | 299792458 | 296823599.072 |  |
| 216000000.0 | 299792458 | 296830365.995 |  |
| 216250000.0 | 299792458 | 296837109.923 |  |
| 216500000.0 | 299792458 | 296843830.959 |  |
| 216750000.0 | 299792458 | 296850529.207 |  |
| 217000000.0 | 299792458 | 296857204.769 |  |
| 217250000.0 | 299792458 | 296863857.746 |  |
| 217500000.0 | 299792458 | 296870488.24 |  |
| 217750000.0 | 299792458 | 296877096.351 |  |
| 218000000.0 | 299792458 | 296883682.181 |  |
| 218250000.0 | 299792458 | 296890245.827 |  |
| 218500000.0 | 299792458 | 296896787.39 |  |
| 218750000.0 | 299792458 | 296903306.968 |  |
| 219000000.0 | 299792458 | 296909804.659 |  |
| 219250000.0 | 299792458 | 296916280.56 |  |
| 219500000.0 | 299792458 | 296922734.767 |  |
| 219750000.0 | 299792458 | 296929167.378 |  |
| 220000000.0 | 299792458 | 296935578.488 |  |
| 220250000.0 | 299792458 | 296941968.192 |  |
| 220500000.0 | 299792458 | 296948336.586 |  |
| 220750000.0 | 299792458 | 296954683.762 |  |
| 221000000.0 | 299792458 | 296961009.816 |  |
| 221250000.0 | 299792458 | 296967314.84 |  |
| 221500000.0 | 299792458 | 296973598.926 |  |
| 221750000.0 | 299792458 | 296979862.167 |  |
| 222000000.0 | 299792458 | 296986104.656 |  |
| 222250000.0 | 299792458 | 296992326.481 |  |
| 222500000.0 | 299792458 | 296998527.736 |  |
| 222750000.0 | 299792458 | 297004708.508 |  |
| 223000000.0 | 299792458 | 297010868.889 |  |
| 223250000.0 | 299792458 | 297017008.968 |  |
| 223500000.0 | 299792458 | 297023128.833 |  |
| 223750000.0 | 299792458 | 297029228.572 |  |
| 224000000.0 | 299792458 | 297035308.273 |  |
| 224250000.0 | 299792458 | 297041368.023 |  |
| 224500000.0 | 299792458 | 297047407.91 |  |
| 224750000.0 | 299792458 | 297053428.019 |  |
| 225000000.0 | 299792458 | 297059428.436 |  |
| 225250000.0 | 299792458 | 297065409.247 |  |
| 225500000.0 | 299792458 | 297071370.537 |  |
| 225750000.0 | 299792458 | 297077312.39 |  |
| 226000000.0 | 299792458 | 297083234.89 |  |
| 226250000.0 | 299792458 | 297089138.121 |  |
| 226500000.0 | 299792458 | 297095022.165 |  |
| 226750000.0 | 299792458 | 297100887.106 |  |
| 227000000.0 | 299792458 | 297106733.026 |  |
| 227250000.0 | 299792458 | 297112560.007 |  |
| 227500000.0 | 299792458 | 297118368.129 |  |
| 227750000.0 | 299792458 | 297124157.474 |  |
| 228000000.0 | 299792458 | 297129928.122 |  |
| 228250000.0 | 299792458 | 297135680.154 |  |
| 228500000.0 | 299792458 | 297141413.649 |  |
| 228750000.0 | 299792458 | 297147128.686 |  |
| 229000000.0 | 299792458 | 297152825.344 |  |
| 229250000.0 | 299792458 | 297158503.701 |  |
| 229500000.0 | 299792458 | 297164163.836 |  |
| 229750000.0 | 299792458 | 297169805.826 |  |
| 230000000.0 | 299792458 | 297175429.747 |  |
| 230250000.0 | 299792458 | 297181035.678 |  |
| 230500000.0 | 299792458 | 297186623.693 |  |
| 230750000.0 | 299792458 | 297192193.869 |  |
| 231000000.0 | 299792458 | 297197746.282 |  |
| 231250000.0 | 299792458 | 297203281.007 |  |
| 231500000.0 | 299792458 | 297208798.117 |  |
| 231750000.0 | 299792458 | 297214297.689 |  |
| 232000000.0 | 299792458 | 297219779.795 |  |
| 232250000.0 | 299792458 | 297225244.509 |  |
| 232500000.0 | 299792458 | 297230691.905 |  |
| 232750000.0 | 299792458 | 297236122.055 |  |
| 233000000.0 | 299792458 | 297241535.031 |  |
| 233250000.0 | 299792458 | 297246930.906 |  |
| 233500000.0 | 299792458 | 297252309.751 |  |
| 233750000.0 | 299792458 | 297257671.638 |  |
| 234000000.0 | 299792458 | 297263016.637 |  |
| 234250000.0 | 299792458 | 297268344.819 |  |
| 234500000.0 | 299792458 | 297273656.254 |  |
| 234750000.0 | 299792458 | 297278951.012 |  |
| 235000000.0 | 299792458 | 297284229.163 |  |
| 235250000.0 | 299792458 | 297289490.775 |  |
| 235500000.0 | 299792458 | 297294735.917 |  |
| 235750000.0 | 299792458 | 297299964.658 |  |
| 236000000.0 | 299792458 | 297305177.065 |  |
| 236250000.0 | 299792458 | 297310373.207 |  |
| 236500000.0 | 299792458 | 297315553.15 |  |
| 236750000.0 | 299792458 | 297320716.962 |  |
| 237000000.0 | 299792458 | 297325864.709 |  |
| 237250000.0 | 299792458 | 297330996.458 |  |
| 237500000.0 | 299792458 | 297336112.274 |  |
| 237750000.0 | 299792458 | 297341212.223 |  |
| 238000000.0 | 299792458 | 297346296.371 |  |
| 238250000.0 | 299792458 | 297351364.782 |  |
| 238500000.0 | 299792458 | 297356417.521 |  |
| 238750000.0 | 299792458 | 297361454.652 |  |
| 239000000.0 | 299792458 | 297366476.239 |  |
| 239250000.0 | 299792458 | 297371482.346 |  |
| 239500000.0 | 299792458 | 297376473.037 |  |
| 239750000.0 | 299792458 | 297381448.373 |  |
| 240000000.0 | 299792458 | 297386408.418 |  |
| 240250000.0 | 299792458 | 297391353.234 |  |
| 240500000.0 | 299792458 | 297396282.883 |  |
| 240750000.0 | 299792458 | 297401197.427 |  |
| 241000000.0 | 299792458 | 297406096.927 |  |
| 241250000.0 | 299792458 | 297410981.444 |  |
| 241500000.0 | 299792458 | 297415851.04 |  |
| 241750000.0 | 299792458 | 297420705.774 |  |
| 242000000.0 | 299792458 | 297425545.707 |  |
| 242250000.0 | 299792458 | 297430370.899 |  |
| 242500000.0 | 299792458 | 297435181.408 |  |
| 242750000.0 | 299792458 | 297439977.296 |  |
| 243000000.0 | 299792458 | 297444758.619 |  |
| 243250000.0 | 299792458 | 297449525.438 |  |
| 243500000.0 | 299792458 | 297454277.81 |  |
| 243750000.0 | 299792458 | 297459015.794 |  |
| 244000000.0 | 299792458 | 297463739.447 |  |
| 244250000.0 | 299792458 | 297468448.827 |  |
| 244500000.0 | 299792458 | 297473143.991 |  |
| 244750000.0 | 299792458 | 297477824.996 |  |
| 245000000.0 | 299792458 | 297482491.899 |  |
| 245250000.0 | 299792458 | 297487144.755 |  |
| 245500000.0 | 299792458 | 297491783.622 |  |
| 245750000.0 | 299792458 | 297496408.555 |  |
| 246000000.0 | 299792458 | 297501019.609 |  |
| 246250000.0 | 299792458 | 297505616.841 |  |
| 246500000.0 | 299792458 | 297510200.303 |  |
| 246750000.0 | 299792458 | 297514770.053 |  |
| 247000000.0 | 299792458 | 297519326.143 |  |
| 247250000.0 | 299792458 | 297523868.628 |  |
| 247500000.0 | 299792458 | 297528397.562 |  |
| 247750000.0 | 299792458 | 297532912.999 |  |
| 248000000.0 | 299792458 | 297537414.992 |  |
| 248250000.0 | 299792458 | 297541903.594 |  |
| 248500000.0 | 299792458 | 297546378.858 |  |
| 248750000.0 | 299792458 | 297550840.836 |  |
| 249000000.0 | 299792458 | 297555289.581 |  |
| 249250000.0 | 299792458 | 297559725.146 |  |
| 249500000.0 | 299792458 | 297564147.581 |  |
| 249750000.0 | 299792458 | 297568556.938 |  |
| 250000000.0 | 299792458 | 297572953.269 |  |
| 250250000.0 | 299792458 | 297577336.625 |  |
| 250500000.0 | 299792458 | 297581707.057 |  |
| 250750000.0 | 299792458 | 297586064.614 |  |
| 251000000.0 | 299792458 | 297590409.348 |  |
| 251250000.0 | 299792458 | 297594741.309 |  |
| 251500000.0 | 299792458 | 297599060.546 |  |
| 251750000.0 | 299792458 | 297603367.109 |  |
| 252000000.0 | 299792458 | 297607661.047 |  |
| 252250000.0 | 299792458 | 297611942.41 |  |
| 252500000.0 | 299792458 | 297616211.246 |  |
| 252750000.0 | 299792458 | 297620467.604 |  |
| 253000000.0 | 299792458 | 297624711.532 |  |
| 253250000.0 | 299792458 | 297628943.08 |  |
| 253500000.0 | 299792458 | 297633162.293 |  |
| 253750000.0 | 299792458 | 297637369.221 |  |
| 254000000.0 | 299792458 | 297641563.91 |  |
| 254250000.0 | 299792458 | 297645746.409 |  |
| 254500000.0 | 299792458 | 297649916.763 |  |
| 254750000.0 | 299792458 | 297654075.02 |  |
| 255000000.0 | 299792458 | 297658221.226 |  |
| 255250000.0 | 299792458 | 297662355.429 |  |
| 255500000.0 | 299792458 | 297666477.673 |  |
| 255750000.0 | 299792458 | 297670588.004 |  |
| 256000000.0 | 299792458 | 297674686.469 |  |
| 256250000.0 | 299792458 | 297678773.113 |  |
| 256500000.0 | 299792458 | 297682847.982 |  |
| 256750000.0 | 299792458 | 297686911.119 |  |
| 257000000.0 | 299792458 | 297690962.57 |  |
| 257250000.0 | 299792458 | 297695002.38 |  |
| 257500000.0 | 299792458 | 297699030.593 |  |
| 257750000.0 | 299792458 | 297703047.254 |  |
| 258000000.0 | 299792458 | 297707052.405 |  |
| 258250000.0 | 299792458 | 297711046.091 |  |
| 258500000.0 | 299792458 | 297715028.356 |  |
| 258750000.0 | 299792458 | 297718999.243 |  |
| 259000000.0 | 299792458 | 297722958.795 |  |
| 259250000.0 | 299792458 | 297726907.055 |  |
| 259500000.0 | 299792458 | 297730844.066 |  |
| 259750000.0 | 299792458 | 297734769.87 |  |
| 260000000.0 | 299792458 | 297738684.509 |  |
| 260250000.0 | 299792458 | 297742588.026 |  |
| 260500000.0 | 299792458 | 297746480.464 |  |
| 260750000.0 | 299792458 | 297750361.862 |  |
| 261000000.0 | 299792458 | 297754232.264 |  |
| 261250000.0 | 299792458 | 297758091.71 |  |
| 261500000.0 | 299792458 | 297761940.241 |  |
| 261750000.0 | 299792458 | 297765777.899 |  |
| 262000000.0 | 299792458 | 297769604.725 |  |
| 262250000.0 | 299792458 | 297773420.758 |  |
| 262500000.0 | 299792458 | 297777226.04 |  |
| 262750000.0 | 299792458 | 297781020.61 |  |
| 263000000.0 | 299792458 | 297784804.509 |  |
| 263250000.0 | 299792458 | 297788577.776 |  |
| 263500000.0 | 299792458 | 297792340.452 |  |
| 263750000.0 | 299792458 | 297796092.575 |  |
| 264000000.0 | 299792458 | 297799834.184 |  |
| 264250000.0 | 299792458 | 297803565.32 |  |
| 264500000.0 | 299792458 | 297807286.02 |  |
| 264750000.0 | 299792458 | 297810996.325 |  |
| 265000000.0 | 299792458 | 297814696.271 |  |
| 265250000.0 | 299792458 | 297818385.898 |  |
| 265500000.0 | 299792458 | 297822065.244 |  |
| 265750000.0 | 299792458 | 297825734.346 |  |
| 266000000.0 | 299792458 | 297829393.243 |  |
| 266250000.0 | 299792458 | 297833041.973 |  |
| 266500000.0 | 299792458 | 297836680.572 |  |
| 266750000.0 | 299792458 | 297840309.079 |  |
| 267000000.0 | 299792458 | 297843927.53 |  |
| 267250000.0 | 299792458 | 297847535.963 |  |
| 267500000.0 | 299792458 | 297851134.413 |  |
| 267750000.0 | 299792458 | 297854722.919 |  |
| 268000000.0 | 299792458 | 297858301.516 |  |
| 268250000.0 | 299792458 | 297861870.241 |  |
| 268500000.0 | 299792458 | 297865429.129 |  |
| 268750000.0 | 299792458 | 297868978.218 |  |
| 269000000.0 | 299792458 | 297872517.542 |  |
| 269250000.0 | 299792458 | 297876047.137 |  |
| 269500000.0 | 299792458 | 297879567.04 |  |
| 269750000.0 | 299792458 | 297883077.284 |  |
| 270000000.0 | 299792458 | 297886577.907 |  |
| 270250000.0 | 299792458 | 297890068.941 |  |
| 270500000.0 | 299792458 | 297893550.423 |  |
| 270750000.0 | 299792458 | 297897022.387 |  |
| 271000000.0 | 299792458 | 297900484.867 |  |
| 271250000.0 | 299792458 | 297903937.899 |  |
| 271500000.0 | 299792458 | 297907381.515 |  |
| 271750000.0 | 299792458 | 297910815.751 |  |
| 272000000.0 | 299792458 | 297914240.64 |  |
| 272250000.0 | 299792458 | 297917656.216 |  |
| 272500000.0 | 299792458 | 297921062.513 |  |
| 272750000.0 | 299792458 | 297924459.564 |  |
| 273000000.0 | 299792458 | 297927847.403 |  |
| 273250000.0 | 299792458 | 297931226.062 |  |
| 273500000.0 | 299792458 | 297934595.574 |  |
| 273750000.0 | 299792458 | 297937955.973 |  |
| 274000000.0 | 299792458 | 297941307.292 |  |
| 274250000.0 | 299792458 | 297944649.562 |  |
| 274500000.0 | 299792458 | 297947982.817 |  |
| 274750000.0 | 299792458 | 297951307.088 |  |
| 275000000.0 | 299792458 | 297954622.408 |  |
| 275250000.0 | 299792458 | 297957928.808 |  |
| 275500000.0 | 299792458 | 297961226.322 |  |
| 275750000.0 | 299792458 | 297964514.979 |  |
| 276000000.0 | 299792458 | 297967794.813 |  |
| 276250000.0 | 299792458 | 297971065.854 |  |
| 276500000.0 | 299792458 | 297974328.133 |  |
| 276750000.0 | 299792458 | 297977581.683 |  |
| 277000000.0 | 299792458 | 297980826.533 |  |
| 277250000.0 | 299792458 | 297984062.715 |  |
| 277500000.0 | 299792458 | 297987290.26 |  |
| 277750000.0 | 299792458 | 297990509.198 |  |
| 278000000.0 | 299792458 | 297993719.559 |  |
| 278250000.0 | 299792458 | 297996921.374 |  |
| 278500000.0 | 299792458 | 298000114.674 |  |
| 278750000.0 | 299792458 | 298003299.488 |  |
| 279000000.0 | 299792458 | 298006475.846 |  |
| 279250000.0 | 299792458 | 298009643.778 |  |
| 279500000.0 | 299792458 | 298012803.314 |  |
| 279750000.0 | 299792458 | 298015954.483 |  |
| 280000000.0 | 299792458 | 298019097.314 |  |
| 280250000.0 | 299792458 | 298022231.838 |  |
| 280500000.0 | 299792458 | 298025358.083 |  |
| 280750000.0 | 299792458 | 298028476.078 |  |
| 281000000.0 | 299792458 | 298031585.852 |  |
| 281250000.0 | 299792458 | 298034687.434 |  |
| 281500000.0 | 299792458 | 298037780.853 |  |
| 281750000.0 | 299792458 | 298040866.137 |  |
| 282000000.0 | 299792458 | 298043943.314 |  |
| 282250000.0 | 299792458 | 298047012.413 |  |
| 282500000.0 | 299792458 | 298050073.462 |  |
| 282750000.0 | 299792458 | 298053126.49 |  |
| 283000000.0 | 299792458 | 298056171.523 |  |
| 283250000.0 | 299792458 | 298059208.59 |  |
| 283500000.0 | 299792458 | 298062237.718 |  |
| 283750000.0 | 299792458 | 298065258.935 |  |
| 284000000.0 | 299792458 | 298068272.269 |  |
| 284250000.0 | 299792458 | 298071277.747 |  |
| 284500000.0 | 299792458 | 298074275.396 |  |
| 284750000.0 | 299792458 | 298077265.242 |  |
| 285000000.0 | 299792458 | 298080247.314 |  |
| 285250000.0 | 299792458 | 298083221.638 |  |
| 285500000.0 | 299792458 | 298086188.24 |  |
| 285750000.0 | 299792458 | 298089147.147 |  |
| 286000000.0 | 299792458 | 298092098.387 |  |
| 286250000.0 | 299792458 | 298095041.984 |  |
| 286500000.0 | 299792458 | 298097977.966 |  |
| 286750000.0 | 299792458 | 298100906.359 |  |
| 287000000.0 | 299792458 | 298103827.188 |  |
| 287250000.0 | 299792458 | 298106740.48 |  |
| 287500000.0 | 299792458 | 298109646.261 |  |
| 287750000.0 | 299792458 | 298112544.556 |  |
| 288000000.0 | 299792458 | 298115435.39 |  |
| 288250000.0 | 299792458 | 298118318.79 |  |
| 288500000.0 | 299792458 | 298121194.781 |  |
| 288750000.0 | 299792458 | 298124063.387 |  |
| 289000000.0 | 299792458 | 298126924.635 |  |
| 289250000.0 | 299792458 | 298129778.55 |  |
| 289500000.0 | 299792458 | 298132625.155 |  |
| 289750000.0 | 299792458 | 298135464.477 |  |
| 290000000.0 | 299792458 | 298138296.539 |  |
| 290250000.0 | 299792458 | 298141121.368 |  |
| 290500000.0 | 299792458 | 298143938.986 |  |
| 290750000.0 | 299792458 | 298146749.419 |  |
| 291000000.0 | 299792458 | 298149552.69 |  |
| 291250000.0 | 299792458 | 298152348.825 |  |
| 291500000.0 | 299792458 | 298155137.847 |  |
| 291750000.0 | 299792458 | 298157919.781 |  |
| 292000000.0 | 299792458 | 298160694.649 |  |
| 292250000.0 | 299792458 | 298163462.477 |  |
| 292500000.0 | 299792458 | 298166223.288 |  |
| 292750000.0 | 299792458 | 298168977.105 |  |
| 293000000.0 | 299792458 | 298171723.952 |  |
| 293250000.0 | 299792458 | 298174463.852 |  |
| 293500000.0 | 299792458 | 298177196.829 |  |
| 293750000.0 | 299792458 | 298179922.907 |  |
| 294000000.0 | 299792458 | 298182642.107 |  |
| 294250000.0 | 299792458 | 298185354.454 |  |
| 294500000.0 | 299792458 | 298188059.97 |  |
| 294750000.0 | 299792458 | 298190758.678 |  |
| 295000000.0 | 299792458 | 298193450.6 |  |
| 295250000.0 | 299792458 | 298196135.76 |  |
| 295500000.0 | 299792458 | 298198814.18 |  |
| 295750000.0 | 299792458 | 298201485.883 |  |
| 296000000.0 | 299792458 | 298204150.89 |  |
| 296250000.0 | 299792458 | 298206809.225 |  |
| 296500000.0 | 299792458 | 298209460.909 |  |
| 296750000.0 | 299792458 | 298212105.965 |  |
| 297000000.0 | 299792458 | 298214744.414 |  |
| 297250000.0 | 299792458 | 298217376.278 |  |
| 297500000.0 | 299792458 | 298220001.58 |  |
| 297750000.0 | 299792458 | 298222620.34 |  |
| 298000000.0 | 299792458 | 298225232.582 |  |
| 298250000.0 | 299792458 | 298227838.325 |  |
| 298500000.0 | 299792458 | 298230437.592 |  |
| 298750000.0 | 299792458 | 298233030.405 |  |
| 299000000.0 | 299792458 | 298235616.783 |  |
| 299250000.0 | 299792458 | 298238196.75 |  |
| 299500000.0 | 299792458 | 298240770.325 |  |
| 299750000.0 | 299792458 | 298243337.53 |  |
| 300000000.0 | 299792458 | 298245898.385 |  |
| 300250000.0 | 299792458 | 298248452.912 |  |
| 300500000.0 | 299792458 | 298251001.132 |  |
| 300750000.0 | 299792458 | 298253543.064 |  |
| 301000000.0 | 299792458 | 298256078.73 |  |
| 301250000.0 | 299792458 | 298258608.15 |  |
| 301500000.0 | 299792458 | 298261131.345 |  |
| 301750000.0 | 299792458 | 298263648.335 |  |
| 302000000.0 | 299792458 | 298266159.141 |  |
| 302250000.0 | 299792458 | 298268663.781 |  |
| 302500000.0 | 299792458 | 298271162.278 |  |
| 302750000.0 | 299792458 | 298273654.649 |  |
| 303000000.0 | 299792458 | 298276140.917 |  |
| 303250000.0 | 299792458 | 298278621.1 |  |
| 303500000.0 | 299792458 | 298281095.218 |  |
| 303750000.0 | 299792458 | 298283563.291 |  |
| 304000000.0 | 299792458 | 298286025.338 |  |
| 304250000.0 | 299792458 | 298288481.38 |  |
| 304500000.0 | 299792458 | 298290931.435 |  |
| 304750000.0 | 299792458 | 298293375.523 |  |
| 305000000.0 | 299792458 | 298295813.664 |  |
| 305250000.0 | 299792458 | 298298245.876 |  |
| 305500000.0 | 299792458 | 298300672.178 |  |
| 305750000.0 | 299792458 | 298303092.59 |  |
| 306000000.0 | 299792458 | 298305507.132 |  |
| 306250000.0 | 299792458 | 298307915.82 |  |
| 306500000.0 | 299792458 | 298310318.676 |  |
| 306750000.0 | 299792458 | 298312715.716 |  |
| 307000000.0 | 299792458 | 298315106.961 |  |
| 307250000.0 | 299792458 | 298317492.428 |  |
| 307500000.0 | 299792458 | 298319872.136 |  |
| 307750000.0 | 299792458 | 298322246.104 |  |
| 308000000.0 | 299792458 | 298324614.35 |  |
| 308250000.0 | 299792458 | 298326976.893 |  |
| 308500000.0 | 299792458 | 298329333.75 |  |
| 308750000.0 | 299792458 | 298331684.939 |  |
| 309000000.0 | 299792458 | 298334030.48 |  |
| 309250000.0 | 299792458 | 298336370.39 |  |
| 309500000.0 | 299792458 | 298338704.687 |  |
| 309750000.0 | 299792458 | 298341033.388 |  |
| 310000000.0 | 299792458 | 298343356.512 |  |
| 310250000.0 | 299792458 | 298345674.077 |  |
| 310500000.0 | 299792458 | 298347986.1 |  |
| 310750000.0 | 299792458 | 298350292.598 |  |
| 311000000.0 | 299792458 | 298352593.589 |  |
| 311250000.0 | 299792458 | 298354889.092 |  |
| 311500000.0 | 299792458 | 298357179.122 |  |
| 311750000.0 | 299792458 | 298359463.698 |  |
| 312000000.0 | 299792458 | 298361742.837 |  |
| 312250000.0 | 299792458 | 298364016.555 |  |
| 312500000.0 | 299792458 | 298366284.871 |  |
| 312750000.0 | 299792458 | 298368547.8 |  |
| 313000000.0 | 299792458 | 298370805.361 |  |
| 313250000.0 | 299792458 | 298373057.57 |  |
| 313500000.0 | 299792458 | 298375304.444 |  |
| 313750000.0 | 299792458 | 298377545.999 |  |
| 314000000.0 | 299792458 | 298379782.253 |  |
| 314250000.0 | 299792458 | 298382013.222 |  |
| 314500000.0 | 299792458 | 298384238.923 |  |
| 314750000.0 | 299792458 | 298386459.372 |  |
| 315000000.0 | 299792458 | 298388674.586 |  |
| 315250000.0 | 299792458 | 298390884.58 |  |
| 315500000.0 | 299792458 | 298393089.373 |  |
| 315750000.0 | 299792458 | 298395288.979 |  |
| 316000000.0 | 299792458 | 298397483.415 |  |
| 316250000.0 | 299792458 | 298399672.697 |  |
| 316500000.0 | 299792458 | 298401856.841 |  |
| 316750000.0 | 299792458 | 298404035.863 |  |
| 317000000.0 | 299792458 | 298406209.78 |  |
| 317250000.0 | 299792458 | 298408378.607 |  |
| 317500000.0 | 299792458 | 298410542.359 |  |
| 317750000.0 | 299792458 | 298412701.054 |  |
| 318000000.0 | 299792458 | 298414854.706 |  |
| 318250000.0 | 299792458 | 298417003.33 |  |
| 318500000.0 | 299792458 | 298419146.944 |  |
| 318750000.0 | 299792458 | 298421285.562 |  |
| 319000000.0 | 299792458 | 298423419.199 |  |
| 319250000.0 | 299792458 | 298425547.872 |  |
| 319500000.0 | 299792458 | 298427671.595 |  |
| 319750000.0 | 299792458 | 298429790.383 |  |
| 320000000.0 | 299792458 | 298431904.253 |  |
| 320250000.0 | 299792458 | 298434013.219 |  |
| 320500000.0 | 299792458 | 298436117.296 |  |
| 320750000.0 | 299792458 | 298438216.5 |  |
| 321000000.0 | 299792458 | 298440310.845 |  |
| 321250000.0 | 299792458 | 298442400.346 |  |
| 321500000.0 | 299792458 | 298444485.019 |  |
| 321750000.0 | 299792458 | 298446564.877 |  |
| 322000000.0 | 299792458 | 298448639.937 |  |
| 322250000.0 | 299792458 | 298450710.212 |  |
| 322500000.0 | 299792458 | 298452775.717 |  |
| 322750000.0 | 299792458 | 298454836.467 |  |
| 323000000.0 | 299792458 | 298456892.476 |  |
| 323250000.0 | 299792458 | 298458943.759 |  |
| 323500000.0 | 299792458 | 298460990.331 |  |
| 323750000.0 | 299792458 | 298463032.205 |  |
| 324000000.0 | 299792458 | 298465069.396 |  |
| 324250000.0 | 299792458 | 298467101.919 |  |
| 324500000.0 | 299792458 | 298469129.787 |  |
| 324750000.0 | 299792458 | 298471153.015 |  |
| 325000000.0 | 299792458 | 298473171.616 |  |
| 325250000.0 | 299792458 | 298475185.606 |  |
| 325500000.0 | 299792458 | 298477194.997 |  |
| 325750000.0 | 299792458 | 298479199.804 |  |
| 326000000.0 | 299792458 | 298481200.041 |  |
| 326250000.0 | 299792458 | 298483195.721 |  |
| 326500000.0 | 299792458 | 298485186.859 |  |
| 326750000.0 | 299792458 | 298487173.468 |  |
| 327000000.0 | 299792458 | 298489155.562 |  |
| 327250000.0 | 299792458 | 298491133.155 |  |
| 327500000.0 | 299792458 | 298493106.259 |  |
| 327750000.0 | 299792458 | 298495074.889 |  |
| 328000000.0 | 299792458 | 298497039.058 |  |
| 328250000.0 | 299792458 | 298498998.78 |  |
| 328500000.0 | 299792458 | 298500954.067 |  |
| 328750000.0 | 299792458 | 298502904.934 |  |
| 329000000.0 | 299792458 | 298504851.393 |  |
| 329250000.0 | 299792458 | 298506793.458 |  |
| 329500000.0 | 299792458 | 298508731.142 |  |
| 329750000.0 | 299792458 | 298510664.459 |  |
| 330000000.0 | 299792458 | 298512593.42 |  |
| 330250000.0 | 299792458 | 298514518.04 |  |
| 330500000.0 | 299792458 | 298516438.33 |  |
| 330750000.0 | 299792458 | 298518354.306 |  |
| 331000000.0 | 299792458 | 298520265.978 |  |
| 331250000.0 | 299792458 | 298522173.36 |  |
| 331500000.0 | 299792458 | 298524076.464 |  |
| 331750000.0 | 299792458 | 298525975.305 |  |
| 332000000.0 | 299792458 | 298527869.893 |  |
| 332250000.0 | 299792458 | 298529760.242 |  |
| 332500000.0 | 299792458 | 298531646.365 |  |
| 332750000.0 | 299792458 | 298533528.274 |  |
| 333000000.0 | 299792458 | 298535405.981 |  |
| 333250000.0 | 299792458 | 298537279.499 |  |
| 333500000.0 | 299792458 | 298539148.841 |  |
| 333750000.0 | 299792458 | 298541014.018 |  |
| 334000000.0 | 299792458 | 298542875.044 |  |
| 334250000.0 | 299792458 | 298544731.93 |  |
| 334500000.0 | 299792458 | 298546584.689 |  |
| 334750000.0 | 299792458 | 298548433.332 |  |
| 335000000.0 | 299792458 | 298550277.873 |  |
| 335250000.0 | 299792458 | 298552118.323 |  |
| 335500000.0 | 299792458 | 298553954.693 |  |
| 335750000.0 | 299792458 | 298555786.997 |  |
| 336000000.0 | 299792458 | 298557615.247 |  |
| 336250000.0 | 299792458 | 298559439.453 |  |
| 336500000.0 | 299792458 | 298561259.629 |  |
| 336750000.0 | 299792458 | 298563075.785 |  |
| 337000000.0 | 299792458 | 298564887.934 |  |
| 337250000.0 | 299792458 | 298566696.087 |  |
| 337500000.0 | 299792458 | 298568500.256 |  |
| 337750000.0 | 299792458 | 298570300.453 |  |
| 338000000.0 | 299792458 | 298572096.69 |  |
| 338250000.0 | 299792458 | 298573888.978 |  |
| 338500000.0 | 299792458 | 298575677.328 |  |
| 338750000.0 | 299792458 | 298577461.752 |  |
| 339000000.0 | 299792458 | 298579242.261 |  |
| 339250000.0 | 299792458 | 298581018.868 |  |
| 339500000.0 | 299792458 | 298582791.583 |  |
| 339750000.0 | 299792458 | 298584560.417 |  |
| 340000000.0 | 299792458 | 298586325.383 |  |
| 340250000.0 | 299792458 | 298588086.49 |  |
| 340500000.0 | 299792458 | 298589843.751 |  |
| 340750000.0 | 299792458 | 298591597.177 |  |
| 341000000.0 | 299792458 | 298593346.778 |  |
| 341250000.0 | 299792458 | 298595092.566 |  |
| 341500000.0 | 299792458 | 298596834.552 |  |
| 341750000.0 | 299792458 | 298598572.747 |  |
| 342000000.0 | 299792458 | 298600307.162 |  |
| 342250000.0 | 299792458 | 298602037.807 |  |
| 342500000.0 | 299792458 | 298603764.694 |  |
| 342750000.0 | 299792458 | 298605487.833 |  |
| 343000000.0 | 299792458 | 298607207.236 |  |
| 343250000.0 | 299792458 | 298608922.913 |  |
| 343500000.0 | 299792458 | 298610634.874 |  |
| 343750000.0 | 299792458 | 298612343.132 |  |
| 344000000.0 | 299792458 | 298614047.695 |  |
| 344250000.0 | 299792458 | 298615748.575 |  |
| 344500000.0 | 299792458 | 298617445.783 |  |
| 344750000.0 | 299792458 | 298619139.328 |  |
| 345000000.0 | 299792458 | 298620829.222 |  |
| 345250000.0 | 299792458 | 298622515.475 |  |
| 345500000.0 | 299792458 | 298624198.097 |  |
| 345750000.0 | 299792458 | 298625877.099 |  |
| 346000000.0 | 299792458 | 298627552.491 |  |
| 346250000.0 | 299792458 | 298629224.283 |  |
| 346500000.0 | 299792458 | 298630892.486 |  |
| 346750000.0 | 299792458 | 298632557.11 |  |
| 347000000.0 | 299792458 | 298634218.165 |  |
| 347250000.0 | 299792458 | 298635875.662 |  |
| 347500000.0 | 299792458 | 298637529.61 |  |
| 347750000.0 | 299792458 | 298639180.019 |  |
| 348000000.0 | 299792458 | 298640826.9 |  |
| 348250000.0 | 299792458 | 298642470.263 |  |
| 348500000.0 | 299792458 | 298644110.118 |  |
| 348750000.0 | 299792458 | 298645746.474 |  |
| 349000000.0 | 299792458 | 298647379.341 |  |
| 349250000.0 | 299792458 | 298649008.73 |  |
| 349500000.0 | 299792458 | 298650634.651 |  |
| 349750000.0 | 299792458 | 298652257.112 |  |
| 350000000.0 | 299792458 | 298653876.125 |  |
| 350250000.0 | 299792458 | 298655491.698 |  |
| 350500000.0 | 299792458 | 298657103.841 |  |
| 350750000.0 | 299792458 | 298658712.565 |  |
| 351000000.0 | 299792458 | 298660317.878 |  |
| 351250000.0 | 299792458 | 298661919.79 |  |
| 351500000.0 | 299792458 | 298663518.311 |  |
| 351750000.0 | 299792458 | 298665113.451 |  |
| 352000000.0 | 299792458 | 298666705.219 |  |
| 352250000.0 | 299792458 | 298668293.624 |  |
| 352500000.0 | 299792458 | 298669878.676 |  |
| 352750000.0 | 299792458 | 298671460.384 |  |
| 353000000.0 | 299792458 | 298673038.758 |  |
| 353250000.0 | 299792458 | 298674613.807 |  |
| 353500000.0 | 299792458 | 298676185.541 |  |
| 353750000.0 | 299792458 | 298677753.968 |  |
| 354000000.0 | 299792458 | 298679319.097 |  |
| 354250000.0 | 299792458 | 298680880.939 |  |
| 354500000.0 | 299792458 | 298682439.503 |  |
| 354750000.0 | 299792458 | 298683994.796 |  |
| 355000000.0 | 299792458 | 298685546.829 |  |
| 355250000.0 | 299792458 | 298687095.611 |  |
| 355500000.0 | 299792458 | 298688641.15 |  |
| 355750000.0 | 299792458 | 298690183.457 |  |
| 356000000.0 | 299792458 | 298691722.539 |  |
| 356250000.0 | 299792458 | 298693258.405 |  |
| 356500000.0 | 299792458 | 298694791.065 |  |
| 356750000.0 | 299792458 | 298696320.528 |  |
| 357000000.0 | 299792458 | 298697846.802 |  |
| 357250000.0 | 299792458 | 298699369.896 |  |
| 357500000.0 | 299792458 | 298700889.82 |  |
| 357750000.0 | 299792458 | 298702406.581 |  |
| 358000000.0 | 299792458 | 298703920.189 |  |
| 358250000.0 | 299792458 | 298705430.652 |  |
| 358500000.0 | 299792458 | 298706937.979 |  |
| 358750000.0 | 299792458 | 298708442.179 |  |
| 359000000.0 | 299792458 | 298709943.259 |  |
| 359250000.0 | 299792458 | 298711441.23 |  |
| 359500000.0 | 299792458 | 298712936.1 |  |
| 359750000.0 | 299792458 | 298714427.876 |  |
| 360000000.0 | 299792458 | 298715916.567 |  |
| 360250000.0 | 299792458 | 298717402.183 |  |
| 360500000.0 | 299792458 | 298718884.731 |  |
| 360750000.0 | 299792458 | 298720364.22 |  |
| 361000000.0 | 299792458 | 298721840.658 |  |
| 361250000.0 | 299792458 | 298723314.054 |  |
| 361500000.0 | 299792458 | 298724784.416 |  |
| 361750000.0 | 299792458 | 298726251.752 |  |
| 362000000.0 | 299792458 | 298727716.071 |  |
| 362250000.0 | 299792458 | 298729177.38 |  |
| 362500000.0 | 299792458 | 298730635.689 |  |
| 362750000.0 | 299792458 | 298732091.004 |  |
| 363000000.0 | 299792458 | 298733543.335 |  |
| 363250000.0 | 299792458 | 298734992.69 |  |
| 363500000.0 | 299792458 | 298736439.076 |  |
| 363750000.0 | 299792458 | 298737882.502 |  |
| 364000000.0 | 299792458 | 298739322.976 |  |
| 364250000.0 | 299792458 | 298740760.505 |  |
| 364500000.0 | 299792458 | 298742195.099 |  |
| 364750000.0 | 299792458 | 298743626.764 |  |
| 365000000.0 | 299792458 | 298745055.509 |  |
| 365250000.0 | 299792458 | 298746481.341 |  |
| 365500000.0 | 299792458 | 298747904.269 |  |
| 365750000.0 | 299792458 | 298749324.301 |  |
| 366000000.0 | 299792458 | 298750741.444 |  |
| 366250000.0 | 299792458 | 298752155.706 |  |
| 366500000.0 | 299792458 | 298753567.095 |  |
| 366750000.0 | 299792458 | 298754975.618 |  |
| 367000000.0 | 299792458 | 298756381.284 |  |
| 367250000.0 | 299792458 | 298757784.1 |  |
| 367500000.0 | 299792458 | 298759184.074 |  |
| 367750000.0 | 299792458 | 298760581.213 |  |
| 368000000.0 | 299792458 | 298761975.525 |  |
| 368250000.0 | 299792458 | 298763367.018 |  |
| 368500000.0 | 299792458 | 298764755.7 |  |
| 368750000.0 | 299792458 | 298766141.577 |  |
| 369000000.0 | 299792458 | 298767524.657 |  |
| 369250000.0 | 299792458 | 298768904.949 |  |
| 369500000.0 | 299792458 | 298770282.458 |  |
| 369750000.0 | 299792458 | 298771657.194 |  |
| 370000000.0 | 299792458 | 298773029.162 |  |
| 370250000.0 | 299792458 | 298774398.372 |  |
| 370500000.0 | 299792458 | 298775764.829 |  |
| 370750000.0 | 299792458 | 298777128.542 |  |
| 371000000.0 | 299792458 | 298778489.517 |  |
| 371250000.0 | 299792458 | 298779847.763 |  |
| 371500000.0 | 299792458 | 298781203.285 |  |
| 371750000.0 | 299792458 | 298782556.093 |  |
| 372000000.0 | 299792458 | 298783906.192 |  |
| 372250000.0 | 299792458 | 298785253.59 |  |
| 372500000.0 | 299792458 | 298786598.295 |  |
| 372750000.0 | 299792458 | 298787940.312 |  |
| 373000000.0 | 299792458 | 298789279.651 |  |
| 373250000.0 | 299792458 | 298790616.316 |  |
| 373500000.0 | 299792458 | 298791950.317 |  |
| 373750000.0 | 299792458 | 298793281.659 |  |
| 374000000.0 | 299792458 | 298794610.351 |  |
| 374250000.0 | 299792458 | 298795936.398 |  |
| 374500000.0 | 299792458 | 298797259.807 |  |
| 374750000.0 | 299792458 | 298798580.587 |  |
| 375000000.0 | 299792458 | 298799898.744 |  |
| 375250000.0 | 299792458 | 298801214.284 |  |
| 375500000.0 | 299792458 | 298802527.215 |  |
| 375750000.0 | 299792458 | 298803837.543 |  |
| 376000000.0 | 299792458 | 298805145.276 |  |
| 376250000.0 | 299792458 | 298806450.42 |  |
| 376500000.0 | 299792458 | 298807752.982 |  |
| 376750000.0 | 299792458 | 298809052.969 |  |
| 377000000.0 | 299792458 | 298810350.387 |  |
| 377250000.0 | 299792458 | 298811645.244 |  |
| 377500000.0 | 299792458 | 298812937.545 |  |
| 377750000.0 | 299792458 | 298814227.299 |  |
| 378000000.0 | 299792458 | 298815514.511 |  |
| 378250000.0 | 299792458 | 298816799.188 |  |
| 378500000.0 | 299792458 | 298818081.337 |  |
| 378750000.0 | 299792458 | 298819360.965 |  |
| 379000000.0 | 299792458 | 298820638.077 |  |
| 379250000.0 | 299792458 | 298821912.681 |  |
| 379500000.0 | 299792458 | 298823184.783 |  |
| 379750000.0 | 299792458 | 298824454.389 |  |
| 380000000.0 | 299792458 | 298825721.507 |  |
| 380250000.0 | 299792458 | 298826986.142 |  |
| 380500000.0 | 299792458 | 298828248.302 |  |
| 380750000.0 | 299792458 | 298829507.992 |  |
| 381000000.0 | 299792458 | 298830765.219 |  |
| 381250000.0 | 299792458 | 298832019.99 |  |
| 381500000.0 | 299792458 | 298833272.31 |  |
| 381750000.0 | 299792458 | 298834522.186 |  |
| 382000000.0 | 299792458 | 298835769.625 |  |
| 382250000.0 | 299792458 | 298837014.633 |  |
| 382500000.0 | 299792458 | 298838257.216 |  |
| 382750000.0 | 299792458 | 298839497.38 |  |
| 383000000.0 | 299792458 | 298840735.132 |  |
| 383250000.0 | 299792458 | 298841970.478 |  |
| 383500000.0 | 299792458 | 298843203.424 |  |
| 383750000.0 | 299792458 | 298844433.976 |  |
| 384000000.0 | 299792458 | 298845662.141 |  |
| 384250000.0 | 299792458 | 298846887.924 |  |
| 384500000.0 | 299792458 | 298848111.333 |  |
| 384750000.0 | 299792458 | 298849332.372 |  |
| 385000000.0 | 299792458 | 298850551.048 |  |
| 385250000.0 | 299792458 | 298851767.368 |  |
| 385500000.0 | 299792458 | 298852981.336 |  |
| 385750000.0 | 299792458 | 298854192.96 |  |
| 386000000.0 | 299792458 | 298855402.245 |  |
| 386250000.0 | 299792458 | 298856609.198 |  |
| 386500000.0 | 299792458 | 298857813.823 |  |
| 386750000.0 | 299792458 | 298859016.128 |  |
| 387000000.0 | 299792458 | 298860216.118 |  |
| 387250000.0 | 299792458 | 298861413.8 |  |
| 387500000.0 | 299792458 | 298862609.178 |  |
| 387750000.0 | 299792458 | 298863802.259 |  |
| 388000000.0 | 299792458 | 298864993.049 |  |
| 388250000.0 | 299792458 | 298866181.553 |  |
| 388500000.0 | 299792458 | 298867367.778 |  |
| 388750000.0 | 299792458 | 298868551.729 |  |
| 389000000.0 | 299792458 | 298869733.413 |  |
| 389250000.0 | 299792458 | 298870912.834 |  |
| 389500000.0 | 299792458 | 298872089.999 |  |
| 389750000.0 | 299792458 | 298873264.913 |  |
| 390000000.0 | 299792458 | 298874437.582 |  |
| 390250000.0 | 299792458 | 298875608.012 |  |
| 390500000.0 | 299792458 | 298876776.209 |  |
| 390750000.0 | 299792458 | 298877942.178 |  |
| 391000000.0 | 299792458 | 298879105.924 |  |
| 391250000.0 | 299792458 | 298880267.454 |  |
| 391500000.0 | 299792458 | 298881426.773 |  |
| 391750000.0 | 299792458 | 298882583.887 |  |
| 392000000.0 | 299792458 | 298883738.801 |  |
| 392250000.0 | 299792458 | 298884891.52 |  |
| 392500000.0 | 299792458 | 298886042.051 |  |
| 392750000.0 | 299792458 | 298887190.399 |  |
| 393000000.0 | 299792458 | 298888336.57 |  |
| 393250000.0 | 299792458 | 298889480.568 |  |
| 393500000.0 | 299792458 | 298890622.4 |  |
| 393750000.0 | 299792458 | 298891762.07 |  |
| 394000000.0 | 299792458 | 298892899.585 |  |
| 394250000.0 | 299792458 | 298894034.949 |  |
| 394500000.0 | 299792458 | 298895168.169 |  |
| 394750000.0 | 299792458 | 298896299.248 |  |
| 395000000.0 | 299792458 | 298897428.194 |  |
| 395250000.0 | 299792458 | 298898555.011 |  |
| 395500000.0 | 299792458 | 298899679.705 |  |
| 395750000.0 | 299792458 | 298900802.28 |  |
| 396000000.0 | 299792458 | 298901922.743 |  |
| 396250000.0 | 299792458 | 298903041.098 |  |
| 396500000.0 | 299792458 | 298904157.351 |  |
| 396750000.0 | 299792458 | 298905271.507 |  |
| 397000000.0 | 299792458 | 298906383.571 |  |
| 397250000.0 | 299792458 | 298907493.549 |  |
| 397500000.0 | 299792458 | 298908601.445 |  |
| 397750000.0 | 299792458 | 298909707.266 |  |
| 398000000.0 | 299792458 | 298910811.015 |  |
| 398250000.0 | 299792458 | 298911912.699 |  |
| 398500000.0 | 299792458 | 298913012.322 |  |
| 398750000.0 | 299792458 | 298914109.889 |  |
| 399000000.0 | 299792458 | 298915205.406 |  |
| 399250000.0 | 299792458 | 298916298.878 |  |
| 399500000.0 | 299792458 | 298917390.309 |  |
| 399750000.0 | 299792458 | 298918479.705 |  |
| 400000000.0 | 299792458 | 298919567.072 |  |
| 400250000.0 | 299792458 | 298920652.413 |  |
| 400500000.0 | 299792458 | 298921735.734 |  |
| 400750000.0 | 299792458 | 298922817.04 |  |
| 401000000.0 | 299792458 | 298923896.336 |  |
| 401250000.0 | 299792458 | 298924973.627 |  |
| 401500000.0 | 299792458 | 298926048.918 |  |
| 401750000.0 | 299792458 | 298927122.213 |  |
| 402000000.0 | 299792458 | 298928193.519 |  |
| 402250000.0 | 299792458 | 298929262.839 |  |
| 402500000.0 | 299792458 | 298930330.178 |  |
| 402750000.0 | 299792458 | 298931395.542 |  |
| 403000000.0 | 299792458 | 298932458.935 |  |
| 403250000.0 | 299792458 | 298933520.363 |  |
| 403500000.0 | 299792458 | 298934579.829 |  |
| 403750000.0 | 299792458 | 298935637.339 |  |
| 404000000.0 | 299792458 | 298936692.898 |  |
| 404250000.0 | 299792458 | 298937746.51 |  |
| 404500000.0 | 299792458 | 298938798.18 |  |
| 404750000.0 | 299792458 | 298939847.914 |  |
| 405000000.0 | 299792458 | 298940895.715 |  |
| 405250000.0 | 299792458 | 298941941.588 |  |
| 405500000.0 | 299792458 | 298942985.538 |  |
| 405750000.0 | 299792458 | 298944027.571 |  |
| 406000000.0 | 299792458 | 298945067.689 |  |
| 406250000.0 | 299792458 | 298946105.899 |  |
| 406500000.0 | 299792458 | 298947142.205 |  |
| 406750000.0 | 299792458 | 298948176.612 |  |
| 407000000.0 | 299792458 | 298949209.123 |  |
| 407250000.0 | 299792458 | 298950239.744 |  |
| 407500000.0 | 299792458 | 298951268.48 |  |
| 407750000.0 | 299792458 | 298952295.335 |  |
| 408000000.0 | 299792458 | 298953320.313 |  |
| 408250000.0 | 299792458 | 298954343.419 |  |
| 408500000.0 | 299792458 | 298955364.658 |  |
| 408750000.0 | 299792458 | 298956384.034 |  |
| 409000000.0 | 299792458 | 298957401.551 |  |
| 409250000.0 | 299792458 | 298958417.215 |  |
| 409500000.0 | 299792458 | 298959431.03 |  |
| 409750000.0 | 299792458 | 298960443 |  |
| 410000000.0 | 299792458 | 298961453.129 |  |
| 410250000.0 | 299792458 | 298962461.423 |  |
| 410500000.0 | 299792458 | 298963467.885 |  |
| 410750000.0 | 299792458 | 298964472.52 |  |
| 411000000.0 | 299792458 | 298965475.332 |  |
| 411250000.0 | 299792458 | 298966476.327 |  |
| 411500000.0 | 299792458 | 298967475.507 |  |
| 411750000.0 | 299792458 | 298968472.878 |  |
| 412000000.0 | 299792458 | 298969468.444 |  |
| 412250000.0 | 299792458 | 298970462.209 |  |
| 412500000.0 | 299792458 | 298971454.178 |  |
| 412750000.0 | 299792458 | 298972444.354 |  |
| 413000000.0 | 299792458 | 298973432.743 |  |
| 413250000.0 | 299792458 | 298974419.348 |  |
| 413500000.0 | 299792458 | 298975404.174 |  |
| 413750000.0 | 299792458 | 298976387.226 |  |
| 414000000.0 | 299792458 | 298977368.506 |  |
| 414250000.0 | 299792458 | 298978348.02 |  |
| 414500000.0 | 299792458 | 298979325.772 |  |
| 414750000.0 | 299792458 | 298980301.766 |  |
| 415000000.0 | 299792458 | 298981276.006 |  |
| 415250000.0 | 299792458 | 298982248.496 |  |
| 415500000.0 | 299792458 | 298983219.242 |  |
| 415750000.0 | 299792458 | 298984188.245 |  |
| 416000000.0 | 299792458 | 298985155.512 |  |
| 416250000.0 | 299792458 | 298986121.046 |  |
| 416500000.0 | 299792458 | 298987084.851 |  |
| 416750000.0 | 299792458 | 298988046.931 |  |
| 417000000.0 | 299792458 | 298989007.291 |  |
| 417250000.0 | 299792458 | 298989965.934 |  |
| 417500000.0 | 299792458 | 298990922.865 |  |
| 417750000.0 | 299792458 | 298991878.088 |  |
| 418000000.0 | 299792458 | 298992831.606 |  |
| 418250000.0 | 299792458 | 298993783.424 |  |
| 418500000.0 | 299792458 | 298994733.546 |  |
| 418750000.0 | 299792458 | 298995681.976 |  |
| 419000000.0 | 299792458 | 298996628.717 |  |
| 419250000.0 | 299792458 | 298997573.774 |  |
| 419500000.0 | 299792458 | 298998517.152 |  |
| 419750000.0 | 299792458 | 298999458.853 |  |
| 420000000.0 | 299792458 | 299000398.881 |  |
| 420250000.0 | 299792458 | 299001337.242 |  |
| 420500000.0 | 299792458 | 299002273.938 |  |
| 420750000.0 | 299792458 | 299003208.974 |  |
| 421000000.0 | 299792458 | 299004142.353 |  |
| 421250000.0 | 299792458 | 299005074.08 |  |
| 421500000.0 | 299792458 | 299006004.158 |  |
| 421750000.0 | 299792458 | 299006932.591 |  |
| 422000000.0 | 299792458 | 299007859.383 |  |
| 422250000.0 | 299792458 | 299008784.538 |  |
| 422500000.0 | 299792458 | 299009708.06 |  |
| 422750000.0 | 299792458 | 299010629.952 |  |
| 423000000.0 | 299792458 | 299011550.219 |  |
| 423250000.0 | 299792458 | 299012468.864 |  |
| 423500000.0 | 299792458 | 299013385.891 |  |
| 423750000.0 | 299792458 | 299014301.304 |  |
| 424000000.0 | 299792458 | 299015215.107 |  |
| 424250000.0 | 299792458 | 299016127.303 |  |
| 424500000.0 | 299792458 | 299017037.896 |  |
| 424750000.0 | 299792458 | 299017946.89 |  |
| 425000000.0 | 299792458 | 299018854.289 |  |
| 425250000.0 | 299792458 | 299019760.096 |  |
| 425500000.0 | 299792458 | 299020664.315 |  |
| 425750000.0 | 299792458 | 299021566.95 |  |
| 426000000.0 | 299792458 | 299022468.004 |  |
| 426250000.0 | 299792458 | 299023367.482 |  |
| 426500000.0 | 299792458 | 299024265.386 |  |
| 426750000.0 | 299792458 | 299025161.721 |  |
| 427000000.0 | 299792458 | 299026056.49 |  |
| 427250000.0 | 299792458 | 299026949.697 |  |
| 427500000.0 | 299792458 | 299027841.345 |  |
| 427750000.0 | 299792458 | 299028731.438 |  |
| 428000000.0 | 299792458 | 299029619.98 |  |
| 428250000.0 | 299792458 | 299030506.974 |  |
| 428500000.0 | 299792458 | 299031392.424 |  |
| 428750000.0 | 299792458 | 299032276.333 |  |
| 429000000.0 | 299792458 | 299033158.705 |  |
| 429250000.0 | 299792458 | 299034039.544 |  |
| 429500000.0 | 299792458 | 299034918.853 |  |
| 429750000.0 | 299792458 | 299035796.636 |  |
| 430000000.0 | 299792458 | 299036672.895 |  |
| 430250000.0 | 299792458 | 299037547.636 |  |
| 430500000.0 | 299792458 | 299038420.86 |  |
| 430750000.0 | 299792458 | 299039292.572 |  |
| 431000000.0 | 299792458 | 299040162.776 |  |
| 431250000.0 | 299792458 | 299041031.473 |  |
| 431500000.0 | 299792458 | 299041898.669 |  |
| 431750000.0 | 299792458 | 299042764.367 |  |
| 432000000.0 | 299792458 | 299043628.569 |  |
| 432250000.0 | 299792458 | 299044491.28 |  |
| 432500000.0 | 299792458 | 299045352.503 |  |
| 432750000.0 | 299792458 | 299046212.241 |  |
| 433000000.0 | 299792458 | 299047070.498 |  |
| 433250000.0 | 299792458 | 299047927.277 |  |
| 433500000.0 | 299792458 | 299048782.581 |  |
| 433750000.0 | 299792458 | 299049636.414 |  |
| 434000000.0 | 299792458 | 299050488.779 |  |
| 434250000.0 | 299792458 | 299051339.68 |  |
| 434500000.0 | 299792458 | 299052189.12 |  |
| 434750000.0 | 299792458 | 299053037.102 |  |
| 435000000.0 | 299792458 | 299053883.629 |  |
| 435250000.0 | 299792458 | 299054728.706 |  |
| 435500000.0 | 299792458 | 299055572.334 |  |
| 435750000.0 | 299792458 | 299056414.518 |  |
| 436000000.0 | 299792458 | 299057255.261 |  |
| 436250000.0 | 299792458 | 299058094.566 |  |
| 436500000.0 | 299792458 | 299058932.437 |  |
| 436750000.0 | 299792458 | 299059768.876 |  |
| 437000000.0 | 299792458 | 299060603.887 |  |
| 437250000.0 | 299792458 | 299061437.473 |  |
| 437500000.0 | 299792458 | 299062269.637 |  |
| 437750000.0 | 299792458 | 299063100.383 |  |
| 438000000.0 | 299792458 | 299063929.714 |  |
| 438250000.0 | 299792458 | 299064757.633 |  |
| 438500000.0 | 299792458 | 299065584.143 |  |
| 438750000.0 | 299792458 | 299066409.247 |  |
| 439000000.0 | 299792458 | 299067232.949 |  |
| 439250000.0 | 299792458 | 299068055.252 |  |
| 439500000.0 | 299792458 | 299068876.158 |  |
| 439750000.0 | 299792458 | 299069695.672 |  |
| 440000000.0 | 299792458 | 299070513.796 |  |
| 440250000.0 | 299792458 | 299071330.533 |  |
| 440500000.0 | 299792458 | 299072145.887 |  |
| 440750000.0 | 299792458 | 299072959.861 |  |
| 441000000.0 | 299792458 | 299073772.457 |  |
| 441250000.0 | 299792458 | 299074583.679 |  |
| 441500000.0 | 299792458 | 299075393.529 |  |
| 441750000.0 | 299792458 | 299076202.012 |  |
| 442000000.0 | 299792458 | 299077009.13 |  |
| 442250000.0 | 299792458 | 299077814.886 |  |
| 442500000.0 | 299792458 | 299078619.283 |  |
| 442750000.0 | 299792458 | 299079422.325 |  |
| 443000000.0 | 299792458 | 299080224.013 |  |
| 443250000.0 | 299792458 | 299081024.352 |  |
| 443500000.0 | 299792458 | 299081823.345 |  |
| 443750000.0 | 299792458 | 299082620.994 |  |
| 444000000.0 | 299792458 | 299083417.302 |  |
| 444250000.0 | 299792458 | 299084212.272 |  |
| 444500000.0 | 299792458 | 299085005.908 |  |
| 444750000.0 | 299792458 | 299085798.212 |  |
| 445000000.0 | 299792458 | 299086589.188 |  |
| 445250000.0 | 299792458 | 299087378.837 |  |
| 445500000.0 | 299792458 | 299088167.164 |  |
| 445750000.0 | 299792458 | 299088954.172 |  |
| 446000000.0 | 299792458 | 299089739.862 |  |
| 446250000.0 | 299792458 | 299090524.238 |  |
| 446500000.0 | 299792458 | 299091307.304 |  |
| 446750000.0 | 299792458 | 299092089.061 |  |
| 447000000.0 | 299792458 | 299092869.513 |  |
| 447250000.0 | 299792458 | 299093648.663 |  |
| 447500000.0 | 299792458 | 299094426.513 |  |
| 447750000.0 | 299792458 | 299095203.067 |  |
| 448000000.0 | 299792458 | 299095978.327 |  |
| 448250000.0 | 299792458 | 299096752.296 |  |
| 448500000.0 | 299792458 | 299097524.978 |  |
| 448750000.0 | 299792458 | 299098296.374 |  |
| 449000000.0 | 299792458 | 299099066.489 |  |
| 449250000.0 | 299792458 | 299099835.324 |  |
| 449500000.0 | 299792458 | 299100602.882 |  |
| 449750000.0 | 299792458 | 299101369.167 |  |
| 450000000.0 | 299792458 | 299102134.18 |  |
| 450250000.0 | 299792458 | 299102897.926 |  |
| 450500000.0 | 299792458 | 299103660.406 |  |
| 450750000.0 | 299792458 | 299104421.624 |  |
| 451000000.0 | 299792458 | 299105181.582 |  |
| 451250000.0 | 299792458 | 299105940.283 |  |
| 451500000.0 | 299792458 | 299106697.73 |  |
| 451750000.0 | 299792458 | 299107453.925 |  |
| 452000000.0 | 299792458 | 299108208.872 |  |
| 452250000.0 | 299792458 | 299108962.573 |  |
| 452500000.0 | 299792458 | 299109715.031 |  |
| 452750000.0 | 299792458 | 299110466.248 |  |
| 453000000.0 | 299792458 | 299111216.227 |  |
| 453250000.0 | 299792458 | 299111964.972 |  |
| 453500000.0 | 299792458 | 299112712.484 |  |
| 453750000.0 | 299792458 | 299113458.766 |  |
| 454000000.0 | 299792458 | 299114203.822 |  |
| 454250000.0 | 299792458 | 299114947.653 |  |
| 454500000.0 | 299792458 | 299115690.262 |  |
| 454750000.0 | 299792458 | 299116431.653 |  |
| 455000000.0 | 299792458 | 299117171.828 |  |
| 455250000.0 | 299792458 | 299117910.789 |  |
| 455500000.0 | 299792458 | 299118648.539 |  |
| 455750000.0 | 299792458 | 299119385.081 |  |
| 456000000.0 | 299792458 | 299120120.417 |  |
| 456250000.0 | 299792458 | 299120854.55 |  |
| 456500000.0 | 299792458 | 299121587.482 |  |
| 456750000.0 | 299792458 | 299122319.217 |  |
| 457000000.0 | 299792458 | 299123049.757 |  |
| 457250000.0 | 299792458 | 299123779.104 |  |
| 457500000.0 | 299792458 | 299124507.261 |  |
| 457750000.0 | 299792458 | 299125234.23 |  |
| 458000000.0 | 299792458 | 299125960.015 |  |
| 458250000.0 | 299792458 | 299126684.618 |  |
| 458500000.0 | 299792458 | 299127408.041 |  |
| 458750000.0 | 299792458 | 299128130.286 |  |
| 459000000.0 | 299792458 | 299128851.357 |  |
| 459250000.0 | 299792458 | 299129571.256 |  |
| 459500000.0 | 299792458 | 299130289.986 |  |
| 459750000.0 | 299792458 | 299131007.548 |  |
| 460000000.0 | 299792458 | 299131723.946 |  |
| 460250000.0 | 299792458 | 299132439.182 |  |
| 460500000.0 | 299792458 | 299133153.259 |  |
| 460750000.0 | 299792458 | 299133866.179 |  |
| 461000000.0 | 299792458 | 299134577.944 |  |
| 461250000.0 | 299792458 | 299135288.557 |  |
| 461500000.0 | 299792458 | 299135998.021 |  |
| 461750000.0 | 299792458 | 299136706.338 |  |
| 462000000.0 | 299792458 | 299137413.51 |  |
| 462250000.0 | 299792458 | 299138119.54 |  |
| 462500000.0 | 299792458 | 299138824.431 |  |
| 462750000.0 | 299792458 | 299139528.184 |  |
| 463000000.0 | 299792458 | 299140230.803 |  |
| 463250000.0 | 299792458 | 299140932.289 |  |
| 463500000.0 | 299792458 | 299141632.646 |  |
| 463750000.0 | 299792458 | 299142331.875 |  |
| 464000000.0 | 299792458 | 299143029.979 |  |
| 464250000.0 | 299792458 | 299143726.96 |  |
| 464500000.0 | 299792458 | 299144422.822 |  |
| 464750000.0 | 299792458 | 299145117.565 |  |
| 465000000.0 | 299792458 | 299145811.193 |  |
| 465250000.0 | 299792458 | 299146503.708 |  |
| 465500000.0 | 299792458 | 299147195.112 |  |
| 465750000.0 | 299792458 | 299147885.408 |  |
| 466000000.0 | 299792458 | 299148574.598 |  |
| 466250000.0 | 299792458 | 299149262.685 |  |
| 466500000.0 | 299792458 | 299149949.67 |  |
| 466750000.0 | 299792458 | 299150635.557 |  |
| 467000000.0 | 299792458 | 299151320.347 |  |
| 467250000.0 | 299792458 | 299152004.042 |  |
| 467500000.0 | 299792458 | 299152686.646 |  |
| 467750000.0 | 299792458 | 299153368.16 |  |
| 468000000.0 | 299792458 | 299154048.587 |  |
| 468250000.0 | 299792458 | 299154727.929 |  |
| 468500000.0 | 299792458 | 299155406.189 |  |
| 468750000.0 | 299792458 | 299156083.368 |  |
| 469000000.0 | 299792458 | 299156759.469 |  |
| 469250000.0 | 299792458 | 299157434.495 |  |
| 469500000.0 | 299792458 | 299158108.447 |  |
| 469750000.0 | 299792458 | 299158781.327 |  |
| 470000000.0 | 299792458 | 299159453.139 |  |
| 470250000.0 | 299792458 | 299160123.884 |  |
| 470500000.0 | 299792458 | 299160793.565 |  |
| 470750000.0 | 299792458 | 299161462.184 |  |
| 471000000.0 | 299792458 | 299162129.742 |  |
| 471250000.0 | 299792458 | 299162796.243 |  |
| 471500000.0 | 299792458 | 299163461.689 |  |
| 471750000.0 | 299792458 | 299164126.081 |  |
| 472000000.0 | 299792458 | 299164789.422 |  |
| 472250000.0 | 299792458 | 299165451.715 |  |
| 472500000.0 | 299792458 | 299166112.96 |  |
| 472750000.0 | 299792458 | 299166773.162 |  |
| 473000000.0 | 299792458 | 299167432.321 |  |
| 473250000.0 | 299792458 | 299168090.44 |  |
| 473500000.0 | 299792458 | 299168747.522 |  |
| 473750000.0 | 299792458 | 299169403.568 |  |
| 474000000.0 | 299792458 | 299170058.58 |  |
| 474250000.0 | 299792458 | 299170712.561 |  |
| 474500000.0 | 299792458 | 299171365.513 |  |
| 474750000.0 | 299792458 | 299172017.438 |  |
| 475000000.0 | 299792458 | 299172668.338 |  |
| 475250000.0 | 299792458 | 299173318.215 |  |
| 475500000.0 | 299792458 | 299173967.072 |  |
| 475750000.0 | 299792458 | 299174614.911 |  |
| 476000000.0 | 299792458 | 299175261.733 |  |
| 476250000.0 | 299792458 | 299175907.541 |  |
| 476500000.0 | 299792458 | 299176552.337 |  |
| 476750000.0 | 299792458 | 299177196.123 |  |
| 477000000.0 | 299792458 | 299177838.901 |  |
| 477250000.0 | 299792458 | 299178480.673 |  |
| 477500000.0 | 299792458 | 299179121.442 |  |
| 477750000.0 | 299792458 | 299179761.209 |  |
| 478000000.0 | 299792458 | 299180399.977 |  |
| 478250000.0 | 299792458 | 299181037.748 |  |
| 478500000.0 | 299792458 | 299181674.523 |  |
| 478750000.0 | 299792458 | 299182310.304 |  |
| 479000000.0 | 299792458 | 299182945.095 |  |
| 479250000.0 | 299792458 | 299183578.897 |  |
| 479500000.0 | 299792458 | 299184211.711 |  |
| 479750000.0 | 299792458 | 299184843.541 |  |
| 480000000.0 | 299792458 | 299185474.387 |  |
| 480250000.0 | 299792458 | 299186104.253 |  |
| 480500000.0 | 299792458 | 299186733.139 |  |
| 480750000.0 | 299792458 | 299187361.049 |  |
| 481000000.0 | 299792458 | 299187987.984 |  |
| 481250000.0 | 299792458 | 299188613.946 |  |
| 481500000.0 | 299792458 | 299189238.937 |  |
| 481750000.0 | 299792458 | 299189862.959 |  |
| 482000000.0 | 299792458 | 299190486.015 |  |
| 482250000.0 | 299792458 | 299191108.105 |  |
| 482500000.0 | 299792458 | 299191729.233 |  |
| 482750000.0 | 299792458 | 299192349.4 |  |
| 483000000.0 | 299792458 | 299192968.608 |  |
| 483250000.0 | 299792458 | 299193586.859 |  |
| 483500000.0 | 299792458 | 299194204.155 |  |
| 483750000.0 | 299792458 | 299194820.498 |  |
| 484000000.0 | 299792458 | 299195435.89 |  |
| 484250000.0 | 299792458 | 299196050.333 |  |
| 484500000.0 | 299792458 | 299196663.829 |  |
| 484750000.0 | 299792458 | 299197276.38 |  |
| 485000000.0 | 299792458 | 299197887.987 |  |
| 485250000.0 | 299792458 | 299198498.654 |  |
| 485500000.0 | 299792458 | 299199108.38 |  |
| 485750000.0 | 299792458 | 299199717.17 |  |
| 486000000.0 | 299792458 | 299200325.023 |  |
| 486250000.0 | 299792458 | 299200931.944 |  |
| 486500000.0 | 299792458 | 299201537.932 |  |
| 486750000.0 | 299792458 | 299202142.991 |  |
| 487000000.0 | 299792458 | 299202747.121 |  |
| 487250000.0 | 299792458 | 299203350.326 |  |
| 487500000.0 | 299792458 | 299203952.607 |  |
| 487750000.0 | 299792458 | 299204553.965 |  |
| 488000000.0 | 299792458 | 299205154.403 |  |
| 488250000.0 | 299792458 | 299205753.922 |  |
| 488500000.0 | 299792458 | 299206352.525 |  |
| 488750000.0 | 299792458 | 299206950.213 |  |
| 489000000.0 | 299792458 | 299207546.988 |  |
| 489250000.0 | 299792458 | 299208142.853 |  |
| 489500000.0 | 299792458 | 299208737.808 |  |
| 489750000.0 | 299792458 | 299209331.855 |  |
| 490000000.0 | 299792458 | 299209924.997 |  |
| 490250000.0 | 299792458 | 299210517.236 |  |
| 490500000.0 | 299792458 | 299211108.572 |  |
| 490750000.0 | 299792458 | 299211699.009 |  |
| 491000000.0 | 299792458 | 299212288.548 |  |
| 491250000.0 | 299792458 | 299212877.19 |  |
| 491500000.0 | 299792458 | 299213464.937 |  |
| 491750000.0 | 299792458 | 299214051.792 |  |
| 492000000.0 | 299792458 | 299214637.756 |  |
| 492250000.0 | 299792458 | 299215222.831 |  |
| 492500000.0 | 299792458 | 299215807.018 |  |
| 492750000.0 | 299792458 | 299216390.32 |  |
| 493000000.0 | 299792458 | 299216972.739 |  |
| 493250000.0 | 299792458 | 299217554.275 |  |
| 493500000.0 | 299792458 | 299218134.931 |  |
| 493750000.0 | 299792458 | 299218714.709 |  |
| 494000000.0 | 299792458 | 299219293.61 |  |
| 494250000.0 | 299792458 | 299219871.636 |  |
| 494500000.0 | 299792458 | 299220448.789 |  |
| 494750000.0 | 299792458 | 299221025.07 |  |
| 495000000.0 | 299792458 | 299221600.482 |  |
| 495250000.0 | 299792458 | 299222175.027 |  |
| 495500000.0 | 299792458 | 299222748.705 |  |
| 495750000.0 | 299792458 | 299223321.518 |  |
| 496000000.0 | 299792458 | 299223893.469 |  |
| 496250000.0 | 299792458 | 299224464.559 |  |
| 496500000.0 | 299792458 | 299225034.79 |  |
| 496750000.0 | 299792458 | 299225604.164 |  |
| 497000000.0 | 299792458 | 299226172.681 |  |
| 497250000.0 | 299792458 | 299226740.345 |  |
| 497500000.0 | 299792458 | 299227307.156 |  |
| 497750000.0 | 299792458 | 299227873.117 |  |
| 498000000.0 | 299792458 | 299228438.229 |  |
| 498250000.0 | 299792458 | 299229002.493 |  |
| 498500000.0 | 299792458 | 299229565.912 |  |
| 498750000.0 | 299792458 | 299230128.487 |  |
| 499000000.0 | 299792458 | 299230690.22 |  |
| 499250000.0 | 299792458 | 299231251.113 |  |
| 499500000.0 | 299792458 | 299231811.166 |  |
| 499750000.0 | 299792458 | 299232370.383 |  |
| 500000000.0 | 299792458 | 299232928.764 |  |